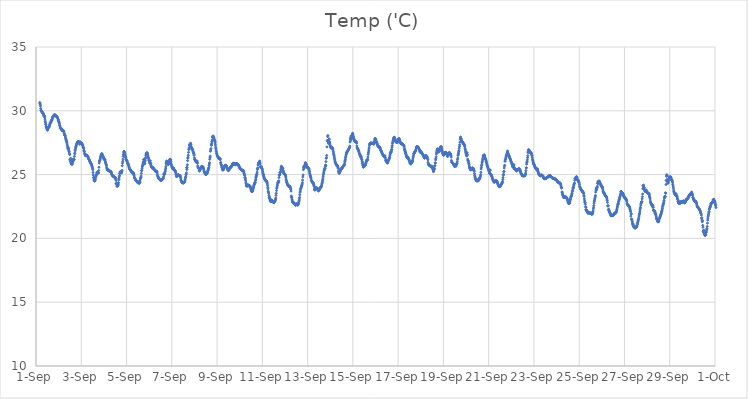
| Category | Temp ('C) |
|---|---|
| 44440.166666666664 | 30.646 |
| 44440.177083333336 | 30.575 |
| 44440.1875 | 30.514 |
| 44440.197916666664 | 30.376 |
| 44440.208333333336 | 30.177 |
| 44440.21875 | 30.047 |
| 44440.229166666664 | 30.001 |
| 44440.239583333336 | 29.987 |
| 44440.25 | 29.944 |
| 44440.260416666664 | 29.91 |
| 44440.270833333336 | 29.903 |
| 44440.28125 | 29.875 |
| 44440.291666666664 | 29.847 |
| 44440.302083333336 | 29.83 |
| 44440.3125 | 29.806 |
| 44440.322916666664 | 29.768 |
| 44440.333333333336 | 29.724 |
| 44440.34375 | 29.614 |
| 44440.354166666664 | 29.581 |
| 44440.364583333336 | 29.625 |
| 44440.375 | 29.577 |
| 44440.385416666664 | 29.495 |
| 44440.395833333336 | 29.354 |
| 44440.40625 | 29.188 |
| 44440.416666666664 | 29.091 |
| 44440.427083333336 | 28.956 |
| 44440.4375 | 28.904 |
| 44440.447916666664 | 28.769 |
| 44440.458333333336 | 28.702 |
| 44440.46875 | 28.644 |
| 44440.479166666664 | 28.683 |
| 44440.489583333336 | 28.524 |
| 44440.5 | 28.495 |
| 44440.510416666664 | 28.494 |
| 44440.520833333336 | 28.568 |
| 44440.53125 | 28.697 |
| 44440.541666666664 | 28.647 |
| 44440.552083333336 | 28.697 |
| 44440.5625 | 28.718 |
| 44440.572916666664 | 28.768 |
| 44440.583333333336 | 28.74 |
| 44440.59375 | 28.829 |
| 44440.604166666664 | 28.922 |
| 44440.614583333336 | 28.968 |
| 44440.625 | 29.049 |
| 44440.635416666664 | 29.07 |
| 44440.645833333336 | 29.068 |
| 44440.65625 | 29.108 |
| 44440.666666666664 | 29.154 |
| 44440.677083333336 | 29.228 |
| 44440.6875 | 29.249 |
| 44440.697916666664 | 29.258 |
| 44440.708333333336 | 29.309 |
| 44440.71875 | 29.369 |
| 44440.729166666664 | 29.441 |
| 44440.739583333336 | 29.498 |
| 44440.75 | 29.543 |
| 44440.760416666664 | 29.553 |
| 44440.770833333336 | 29.556 |
| 44440.78125 | 29.607 |
| 44440.791666666664 | 29.647 |
| 44440.802083333336 | 29.67 |
| 44440.8125 | 29.69 |
| 44440.822916666664 | 29.695 |
| 44440.833333333336 | 29.688 |
| 44440.84375 | 29.651 |
| 44440.854166666664 | 29.646 |
| 44440.864583333336 | 29.614 |
| 44440.875 | 29.609 |
| 44440.885416666664 | 29.603 |
| 44440.895833333336 | 29.588 |
| 44440.90625 | 29.556 |
| 44440.916666666664 | 29.551 |
| 44440.927083333336 | 29.521 |
| 44440.9375 | 29.498 |
| 44440.947916666664 | 29.475 |
| 44440.958333333336 | 29.44 |
| 44440.96875 | 29.359 |
| 44440.979166666664 | 29.27 |
| 44440.989583333336 | 29.284 |
| 44441.0 | 29.163 |
| 44441.010416666664 | 29.133 |
| 44441.020833333336 | 29.065 |
| 44441.03125 | 29.02 |
| 44441.041666666664 | 28.881 |
| 44441.052083333336 | 28.841 |
| 44441.0625 | 28.731 |
| 44441.072916666664 | 28.642 |
| 44441.083333333336 | 28.627 |
| 44441.09375 | 28.61 |
| 44441.104166666664 | 28.615 |
| 44441.114583333336 | 28.626 |
| 44441.125 | 28.555 |
| 44441.135416666664 | 28.506 |
| 44441.145833333336 | 28.491 |
| 44441.15625 | 28.468 |
| 44441.166666666664 | 28.454 |
| 44441.177083333336 | 28.452 |
| 44441.1875 | 28.456 |
| 44441.197916666664 | 28.441 |
| 44441.208333333336 | 28.447 |
| 44441.21875 | 28.422 |
| 44441.229166666664 | 28.368 |
| 44441.239583333336 | 28.267 |
| 44441.25 | 28.201 |
| 44441.260416666664 | 28.107 |
| 44441.270833333336 | 28.096 |
| 44441.28125 | 28.092 |
| 44441.291666666664 | 28.029 |
| 44441.302083333336 | 27.924 |
| 44441.3125 | 27.817 |
| 44441.322916666664 | 27.737 |
| 44441.333333333336 | 27.701 |
| 44441.34375 | 27.629 |
| 44441.354166666664 | 27.575 |
| 44441.364583333336 | 27.494 |
| 44441.375 | 27.395 |
| 44441.385416666664 | 27.284 |
| 44441.395833333336 | 27.167 |
| 44441.40625 | 27.08 |
| 44441.416666666664 | 27.021 |
| 44441.427083333336 | 26.992 |
| 44441.4375 | 27.098 |
| 44441.447916666664 | 26.918 |
| 44441.458333333336 | 26.818 |
| 44441.46875 | 26.768 |
| 44441.479166666664 | 26.622 |
| 44441.489583333336 | 26.572 |
| 44441.5 | 26.17 |
| 44441.510416666664 | 26.148 |
| 44441.520833333336 | 26.018 |
| 44441.53125 | 26.281 |
| 44441.541666666664 | 26.144 |
| 44441.552083333336 | 25.876 |
| 44441.5625 | 25.839 |
| 44441.572916666664 | 25.825 |
| 44441.583333333336 | 25.838 |
| 44441.59375 | 25.859 |
| 44441.604166666664 | 25.802 |
| 44441.614583333336 | 25.955 |
| 44441.625 | 26.014 |
| 44441.635416666664 | 26.052 |
| 44441.645833333336 | 26.215 |
| 44441.65625 | 26.161 |
| 44441.666666666664 | 26.156 |
| 44441.677083333336 | 26.182 |
| 44441.6875 | 26.187 |
| 44441.697916666664 | 26.426 |
| 44441.708333333336 | 26.635 |
| 44441.71875 | 26.69 |
| 44441.729166666664 | 26.866 |
| 44441.739583333336 | 26.97 |
| 44441.75 | 27.085 |
| 44441.760416666664 | 27.173 |
| 44441.770833333336 | 27.219 |
| 44441.78125 | 27.304 |
| 44441.791666666664 | 27.374 |
| 44441.802083333336 | 27.432 |
| 44441.8125 | 27.462 |
| 44441.822916666664 | 27.502 |
| 44441.833333333336 | 27.53 |
| 44441.84375 | 27.553 |
| 44441.854166666664 | 27.568 |
| 44441.864583333336 | 27.571 |
| 44441.875 | 27.567 |
| 44441.885416666664 | 27.567 |
| 44441.895833333336 | 27.555 |
| 44441.90625 | 27.543 |
| 44441.916666666664 | 27.545 |
| 44441.927083333336 | 27.382 |
| 44441.9375 | 27.528 |
| 44441.947916666664 | 27.57 |
| 44441.958333333336 | 27.513 |
| 44441.96875 | 27.507 |
| 44441.979166666664 | 27.47 |
| 44441.989583333336 | 27.466 |
| 44442.0 | 27.478 |
| 44442.010416666664 | 27.431 |
| 44442.020833333336 | 27.458 |
| 44442.03125 | 27.418 |
| 44442.041666666664 | 27.368 |
| 44442.052083333336 | 27.334 |
| 44442.0625 | 27.334 |
| 44442.072916666664 | 27.24 |
| 44442.083333333336 | 27.161 |
| 44442.09375 | 27.123 |
| 44442.104166666664 | 27.052 |
| 44442.114583333336 | 26.911 |
| 44442.125 | 26.848 |
| 44442.135416666664 | 26.81 |
| 44442.145833333336 | 26.67 |
| 44442.15625 | 26.611 |
| 44442.166666666664 | 26.577 |
| 44442.177083333336 | 26.518 |
| 44442.1875 | 26.492 |
| 44442.197916666664 | 26.478 |
| 44442.208333333336 | 26.507 |
| 44442.21875 | 26.537 |
| 44442.229166666664 | 26.536 |
| 44442.239583333336 | 26.493 |
| 44442.25 | 26.517 |
| 44442.260416666664 | 26.493 |
| 44442.270833333336 | 26.455 |
| 44442.28125 | 26.431 |
| 44442.291666666664 | 26.403 |
| 44442.302083333336 | 26.366 |
| 44442.3125 | 26.307 |
| 44442.322916666664 | 26.253 |
| 44442.333333333336 | 26.209 |
| 44442.34375 | 26.199 |
| 44442.354166666664 | 26.161 |
| 44442.364583333336 | 26.09 |
| 44442.375 | 26.043 |
| 44442.385416666664 | 26.007 |
| 44442.395833333336 | 25.969 |
| 44442.40625 | 25.937 |
| 44442.416666666664 | 25.913 |
| 44442.427083333336 | 25.867 |
| 44442.4375 | 25.803 |
| 44442.447916666664 | 25.837 |
| 44442.458333333336 | 25.744 |
| 44442.46875 | 25.688 |
| 44442.479166666664 | 25.627 |
| 44442.489583333336 | 25.554 |
| 44442.5 | 25.487 |
| 44442.510416666664 | 25.381 |
| 44442.520833333336 | 25.167 |
| 44442.53125 | 24.966 |
| 44442.541666666664 | 24.773 |
| 44442.552083333336 | 24.748 |
| 44442.5625 | 24.562 |
| 44442.572916666664 | 24.614 |
| 44442.583333333336 | 24.5 |
| 44442.59375 | 24.499 |
| 44442.604166666664 | 24.535 |
| 44442.614583333336 | 24.576 |
| 44442.625 | 24.662 |
| 44442.635416666664 | 24.83 |
| 44442.645833333336 | 24.821 |
| 44442.65625 | 24.931 |
| 44442.666666666664 | 25.015 |
| 44442.677083333336 | 24.991 |
| 44442.6875 | 25.131 |
| 44442.697916666664 | 25.195 |
| 44442.708333333336 | 25.121 |
| 44442.71875 | 25.174 |
| 44442.729166666664 | 25.098 |
| 44442.739583333336 | 25.146 |
| 44442.75 | 25.139 |
| 44442.760416666664 | 25.139 |
| 44442.770833333336 | 25.32 |
| 44442.78125 | 25.573 |
| 44442.791666666664 | 25.908 |
| 44442.802083333336 | 26.036 |
| 44442.8125 | 26.056 |
| 44442.822916666664 | 26.12 |
| 44442.833333333336 | 26.2 |
| 44442.84375 | 26.291 |
| 44442.854166666664 | 26.383 |
| 44442.864583333336 | 26.457 |
| 44442.875 | 26.475 |
| 44442.885416666664 | 26.565 |
| 44442.895833333336 | 26.629 |
| 44442.90625 | 26.642 |
| 44442.916666666664 | 26.609 |
| 44442.927083333336 | 26.56 |
| 44442.9375 | 26.512 |
| 44442.947916666664 | 26.468 |
| 44442.958333333336 | 26.427 |
| 44442.96875 | 26.39 |
| 44442.979166666664 | 26.344 |
| 44442.989583333336 | 26.29 |
| 44443.0 | 26.244 |
| 44443.010416666664 | 26.202 |
| 44443.020833333336 | 26.172 |
| 44443.03125 | 26.216 |
| 44443.041666666664 | 26.176 |
| 44443.052083333336 | 26.134 |
| 44443.0625 | 25.996 |
| 44443.072916666664 | 25.958 |
| 44443.083333333336 | 25.888 |
| 44443.09375 | 25.811 |
| 44443.104166666664 | 25.754 |
| 44443.114583333336 | 25.695 |
| 44443.125 | 25.534 |
| 44443.135416666664 | 25.488 |
| 44443.145833333336 | 25.388 |
| 44443.15625 | 25.438 |
| 44443.166666666664 | 25.327 |
| 44443.177083333336 | 25.36 |
| 44443.1875 | 25.351 |
| 44443.197916666664 | 25.371 |
| 44443.208333333336 | 25.348 |
| 44443.21875 | 25.318 |
| 44443.229166666664 | 25.323 |
| 44443.239583333336 | 25.262 |
| 44443.25 | 25.282 |
| 44443.260416666664 | 25.275 |
| 44443.270833333336 | 25.257 |
| 44443.28125 | 25.252 |
| 44443.291666666664 | 25.254 |
| 44443.302083333336 | 25.233 |
| 44443.3125 | 25.211 |
| 44443.322916666664 | 25.2 |
| 44443.333333333336 | 25.129 |
| 44443.34375 | 25.034 |
| 44443.354166666664 | 24.988 |
| 44443.364583333336 | 24.96 |
| 44443.375 | 24.933 |
| 44443.385416666664 | 24.913 |
| 44443.395833333336 | 24.89 |
| 44443.40625 | 24.872 |
| 44443.416666666664 | 24.857 |
| 44443.427083333336 | 24.848 |
| 44443.4375 | 24.844 |
| 44443.447916666664 | 24.83 |
| 44443.458333333336 | 24.838 |
| 44443.46875 | 24.792 |
| 44443.479166666664 | 24.778 |
| 44443.489583333336 | 24.743 |
| 44443.5 | 24.773 |
| 44443.510416666664 | 24.764 |
| 44443.520833333336 | 24.618 |
| 44443.53125 | 24.306 |
| 44443.541666666664 | 24.538 |
| 44443.552083333336 | 24.25 |
| 44443.5625 | 24.277 |
| 44443.572916666664 | 24.086 |
| 44443.583333333336 | 24.253 |
| 44443.59375 | 24.163 |
| 44443.604166666664 | 24.09 |
| 44443.614583333336 | 24.311 |
| 44443.625 | 24.241 |
| 44443.635416666664 | 24.177 |
| 44443.645833333336 | 24.371 |
| 44443.65625 | 24.68 |
| 44443.666666666664 | 24.607 |
| 44443.677083333336 | 24.818 |
| 44443.6875 | 24.913 |
| 44443.697916666664 | 25.084 |
| 44443.708333333336 | 25.133 |
| 44443.71875 | 25.218 |
| 44443.729166666664 | 25.178 |
| 44443.739583333336 | 25.181 |
| 44443.75 | 25.205 |
| 44443.760416666664 | 25.164 |
| 44443.770833333336 | 25.187 |
| 44443.78125 | 25.134 |
| 44443.791666666664 | 25.225 |
| 44443.802083333336 | 25.333 |
| 44443.8125 | 25.699 |
| 44443.822916666664 | 25.904 |
| 44443.833333333336 | 26.05 |
| 44443.84375 | 26.213 |
| 44443.854166666664 | 26.429 |
| 44443.864583333336 | 26.575 |
| 44443.875 | 26.714 |
| 44443.885416666664 | 26.803 |
| 44443.895833333336 | 26.808 |
| 44443.90625 | 26.757 |
| 44443.916666666664 | 26.704 |
| 44443.927083333336 | 26.634 |
| 44443.9375 | 26.542 |
| 44443.947916666664 | 26.448 |
| 44443.958333333336 | 26.368 |
| 44443.96875 | 26.323 |
| 44443.979166666664 | 26.214 |
| 44443.989583333336 | 26.156 |
| 44444.0 | 26.111 |
| 44444.010416666664 | 26.074 |
| 44444.020833333336 | 26.097 |
| 44444.03125 | 26.008 |
| 44444.041666666664 | 25.906 |
| 44444.052083333336 | 25.862 |
| 44444.0625 | 25.861 |
| 44444.072916666664 | 25.826 |
| 44444.083333333336 | 25.733 |
| 44444.09375 | 25.728 |
| 44444.104166666664 | 25.65 |
| 44444.114583333336 | 25.561 |
| 44444.125 | 25.504 |
| 44444.135416666664 | 25.455 |
| 44444.145833333336 | 25.407 |
| 44444.15625 | 25.423 |
| 44444.166666666664 | 25.381 |
| 44444.177083333336 | 25.368 |
| 44444.1875 | 25.301 |
| 44444.197916666664 | 25.291 |
| 44444.208333333336 | 25.263 |
| 44444.21875 | 25.241 |
| 44444.229166666664 | 25.219 |
| 44444.239583333336 | 25.187 |
| 44444.25 | 25.157 |
| 44444.260416666664 | 25.13 |
| 44444.270833333336 | 25.124 |
| 44444.28125 | 25.159 |
| 44444.291666666664 | 25.142 |
| 44444.302083333336 | 25.142 |
| 44444.3125 | 25.066 |
| 44444.322916666664 | 25.021 |
| 44444.333333333336 | 24.941 |
| 44444.34375 | 24.799 |
| 44444.354166666664 | 24.756 |
| 44444.364583333336 | 24.727 |
| 44444.375 | 24.687 |
| 44444.385416666664 | 24.647 |
| 44444.395833333336 | 24.605 |
| 44444.40625 | 24.572 |
| 44444.416666666664 | 24.554 |
| 44444.427083333336 | 24.537 |
| 44444.4375 | 24.516 |
| 44444.447916666664 | 24.487 |
| 44444.458333333336 | 24.463 |
| 44444.46875 | 24.44 |
| 44444.479166666664 | 24.407 |
| 44444.489583333336 | 24.39 |
| 44444.5 | 24.361 |
| 44444.510416666664 | 24.361 |
| 44444.520833333336 | 24.409 |
| 44444.53125 | 24.395 |
| 44444.541666666664 | 24.414 |
| 44444.552083333336 | 24.351 |
| 44444.5625 | 24.303 |
| 44444.572916666664 | 24.458 |
| 44444.583333333336 | 24.444 |
| 44444.59375 | 24.365 |
| 44444.604166666664 | 24.583 |
| 44444.614583333336 | 24.702 |
| 44444.625 | 24.764 |
| 44444.635416666664 | 24.803 |
| 44444.645833333336 | 24.886 |
| 44444.65625 | 25.097 |
| 44444.666666666664 | 25.303 |
| 44444.677083333336 | 25.345 |
| 44444.6875 | 25.49 |
| 44444.697916666664 | 25.613 |
| 44444.708333333336 | 25.686 |
| 44444.71875 | 25.769 |
| 44444.729166666664 | 25.851 |
| 44444.739583333336 | 25.958 |
| 44444.75 | 26.022 |
| 44444.760416666664 | 26.167 |
| 44444.770833333336 | 26.193 |
| 44444.78125 | 25.916 |
| 44444.791666666664 | 25.843 |
| 44444.802083333336 | 25.858 |
| 44444.8125 | 26.002 |
| 44444.822916666664 | 26.099 |
| 44444.833333333336 | 26.242 |
| 44444.84375 | 26.344 |
| 44444.854166666664 | 26.504 |
| 44444.864583333336 | 26.601 |
| 44444.875 | 26.646 |
| 44444.885416666664 | 26.694 |
| 44444.895833333336 | 26.701 |
| 44444.90625 | 26.708 |
| 44444.916666666664 | 26.686 |
| 44444.927083333336 | 26.623 |
| 44444.9375 | 26.53 |
| 44444.947916666664 | 26.444 |
| 44444.958333333336 | 26.363 |
| 44444.96875 | 26.302 |
| 44444.979166666664 | 26.221 |
| 44444.989583333336 | 26.131 |
| 44445.0 | 26.08 |
| 44445.010416666664 | 25.999 |
| 44445.020833333336 | 25.938 |
| 44445.03125 | 25.875 |
| 44445.041666666664 | 25.954 |
| 44445.052083333336 | 26.083 |
| 44445.0625 | 25.899 |
| 44445.072916666664 | 25.849 |
| 44445.083333333336 | 25.727 |
| 44445.09375 | 25.625 |
| 44445.104166666664 | 25.633 |
| 44445.114583333336 | 25.599 |
| 44445.125 | 25.591 |
| 44445.135416666664 | 25.547 |
| 44445.145833333336 | 25.493 |
| 44445.15625 | 25.566 |
| 44445.166666666664 | 25.519 |
| 44445.177083333336 | 25.529 |
| 44445.1875 | 25.471 |
| 44445.197916666664 | 25.481 |
| 44445.208333333336 | 25.439 |
| 44445.21875 | 25.425 |
| 44445.229166666664 | 25.385 |
| 44445.239583333336 | 25.377 |
| 44445.25 | 25.344 |
| 44445.260416666664 | 25.302 |
| 44445.270833333336 | 25.287 |
| 44445.28125 | 25.262 |
| 44445.291666666664 | 25.232 |
| 44445.302083333336 | 25.243 |
| 44445.3125 | 25.254 |
| 44445.322916666664 | 25.254 |
| 44445.333333333336 | 25.269 |
| 44445.34375 | 25.22 |
| 44445.354166666664 | 25.124 |
| 44445.364583333336 | 24.966 |
| 44445.375 | 24.899 |
| 44445.385416666664 | 24.858 |
| 44445.395833333336 | 24.802 |
| 44445.40625 | 24.783 |
| 44445.416666666664 | 24.714 |
| 44445.427083333336 | 24.688 |
| 44445.4375 | 24.67 |
| 44445.447916666664 | 24.653 |
| 44445.458333333336 | 24.653 |
| 44445.46875 | 24.645 |
| 44445.479166666664 | 24.62 |
| 44445.489583333336 | 24.582 |
| 44445.5 | 24.558 |
| 44445.510416666664 | 24.537 |
| 44445.520833333336 | 24.529 |
| 44445.53125 | 24.53 |
| 44445.541666666664 | 24.559 |
| 44445.552083333336 | 24.605 |
| 44445.5625 | 24.627 |
| 44445.572916666664 | 24.623 |
| 44445.583333333336 | 24.644 |
| 44445.59375 | 24.645 |
| 44445.604166666664 | 24.653 |
| 44445.614583333336 | 24.678 |
| 44445.625 | 24.739 |
| 44445.635416666664 | 24.843 |
| 44445.645833333336 | 25.005 |
| 44445.65625 | 25.074 |
| 44445.666666666664 | 25.059 |
| 44445.677083333336 | 25.031 |
| 44445.6875 | 25.039 |
| 44445.697916666664 | 25.136 |
| 44445.708333333336 | 25.255 |
| 44445.71875 | 25.369 |
| 44445.729166666664 | 25.503 |
| 44445.739583333336 | 25.646 |
| 44445.75 | 25.846 |
| 44445.760416666664 | 25.934 |
| 44445.770833333336 | 26.068 |
| 44445.78125 | 26.026 |
| 44445.791666666664 | 25.993 |
| 44445.802083333336 | 26.008 |
| 44445.8125 | 25.927 |
| 44445.822916666664 | 25.845 |
| 44445.833333333336 | 25.824 |
| 44445.84375 | 25.79 |
| 44445.854166666664 | 25.847 |
| 44445.864583333336 | 25.839 |
| 44445.875 | 25.888 |
| 44445.885416666664 | 25.994 |
| 44445.895833333336 | 26.125 |
| 44445.90625 | 26.173 |
| 44445.916666666664 | 26.202 |
| 44445.927083333336 | 26.201 |
| 44445.9375 | 26.19 |
| 44445.947916666664 | 26.14 |
| 44445.958333333336 | 26.036 |
| 44445.96875 | 25.896 |
| 44445.979166666664 | 25.787 |
| 44445.989583333336 | 25.702 |
| 44446.0 | 25.623 |
| 44446.010416666664 | 25.577 |
| 44446.020833333336 | 25.535 |
| 44446.03125 | 25.503 |
| 44446.041666666664 | 25.468 |
| 44446.052083333336 | 25.448 |
| 44446.0625 | 25.44 |
| 44446.072916666664 | 25.493 |
| 44446.083333333336 | 25.515 |
| 44446.09375 | 25.429 |
| 44446.104166666664 | 25.396 |
| 44446.114583333336 | 25.374 |
| 44446.125 | 25.326 |
| 44446.135416666664 | 25.306 |
| 44446.145833333336 | 25.28 |
| 44446.15625 | 25.269 |
| 44446.166666666664 | 25.198 |
| 44446.177083333336 | 25.126 |
| 44446.1875 | 25.011 |
| 44446.197916666664 | 24.963 |
| 44446.208333333336 | 24.84 |
| 44446.21875 | 24.874 |
| 44446.229166666664 | 24.887 |
| 44446.239583333336 | 24.959 |
| 44446.25 | 24.944 |
| 44446.260416666664 | 24.968 |
| 44446.270833333336 | 24.933 |
| 44446.28125 | 24.955 |
| 44446.291666666664 | 24.994 |
| 44446.302083333336 | 24.971 |
| 44446.3125 | 24.937 |
| 44446.322916666664 | 24.938 |
| 44446.333333333336 | 24.888 |
| 44446.34375 | 24.927 |
| 44446.354166666664 | 24.93 |
| 44446.364583333336 | 24.913 |
| 44446.375 | 24.868 |
| 44446.385416666664 | 24.795 |
| 44446.395833333336 | 24.663 |
| 44446.40625 | 24.564 |
| 44446.416666666664 | 24.507 |
| 44446.427083333336 | 24.472 |
| 44446.4375 | 24.435 |
| 44446.447916666664 | 24.406 |
| 44446.458333333336 | 24.381 |
| 44446.46875 | 24.372 |
| 44446.479166666664 | 24.362 |
| 44446.489583333336 | 24.352 |
| 44446.5 | 24.35 |
| 44446.510416666664 | 24.352 |
| 44446.520833333336 | 24.357 |
| 44446.53125 | 24.371 |
| 44446.541666666664 | 24.384 |
| 44446.552083333336 | 24.421 |
| 44446.5625 | 24.43 |
| 44446.572916666664 | 24.46 |
| 44446.583333333336 | 24.56 |
| 44446.59375 | 24.651 |
| 44446.604166666664 | 24.757 |
| 44446.614583333336 | 24.834 |
| 44446.625 | 24.983 |
| 44446.635416666664 | 25.041 |
| 44446.645833333336 | 25.144 |
| 44446.65625 | 25.534 |
| 44446.666666666664 | 25.399 |
| 44446.677083333336 | 25.556 |
| 44446.6875 | 25.764 |
| 44446.697916666664 | 26.094 |
| 44446.708333333336 | 26.287 |
| 44446.71875 | 26.347 |
| 44446.729166666664 | 26.517 |
| 44446.739583333336 | 26.743 |
| 44446.75 | 26.967 |
| 44446.760416666664 | 27.011 |
| 44446.770833333336 | 27.112 |
| 44446.78125 | 27.275 |
| 44446.791666666664 | 27.349 |
| 44446.802083333336 | 27.332 |
| 44446.8125 | 27.422 |
| 44446.822916666664 | 27.328 |
| 44446.833333333336 | 27.455 |
| 44446.84375 | 27.354 |
| 44446.854166666664 | 27.209 |
| 44446.864583333336 | 27.127 |
| 44446.875 | 27.102 |
| 44446.885416666664 | 27.029 |
| 44446.895833333336 | 26.994 |
| 44446.90625 | 26.997 |
| 44446.916666666664 | 26.971 |
| 44446.927083333336 | 26.892 |
| 44446.9375 | 26.806 |
| 44446.947916666664 | 26.758 |
| 44446.958333333336 | 26.7 |
| 44446.96875 | 26.655 |
| 44446.979166666664 | 26.573 |
| 44446.989583333336 | 26.509 |
| 44447.0 | 26.31 |
| 44447.010416666664 | 26.181 |
| 44447.020833333336 | 26.199 |
| 44447.03125 | 26.14 |
| 44447.041666666664 | 26.095 |
| 44447.052083333336 | 26.061 |
| 44447.0625 | 26.032 |
| 44447.072916666664 | 26.021 |
| 44447.083333333336 | 25.979 |
| 44447.09375 | 25.948 |
| 44447.104166666664 | 26.022 |
| 44447.114583333336 | 26.074 |
| 44447.125 | 25.96 |
| 44447.135416666664 | 25.884 |
| 44447.145833333336 | 25.679 |
| 44447.15625 | 25.593 |
| 44447.166666666664 | 25.532 |
| 44447.177083333336 | 25.493 |
| 44447.1875 | 25.49 |
| 44447.197916666664 | 25.514 |
| 44447.208333333336 | 25.293 |
| 44447.21875 | 25.462 |
| 44447.229166666664 | 25.286 |
| 44447.239583333336 | 25.388 |
| 44447.25 | 25.375 |
| 44447.260416666664 | 25.488 |
| 44447.270833333336 | 25.465 |
| 44447.28125 | 25.432 |
| 44447.291666666664 | 25.561 |
| 44447.302083333336 | 25.59 |
| 44447.3125 | 25.645 |
| 44447.322916666664 | 25.634 |
| 44447.333333333336 | 25.6 |
| 44447.34375 | 25.615 |
| 44447.354166666664 | 25.588 |
| 44447.364583333336 | 25.567 |
| 44447.375 | 25.597 |
| 44447.385416666664 | 25.589 |
| 44447.395833333336 | 25.506 |
| 44447.40625 | 25.445 |
| 44447.416666666664 | 25.362 |
| 44447.427083333336 | 25.265 |
| 44447.4375 | 25.213 |
| 44447.447916666664 | 25.165 |
| 44447.458333333336 | 25.138 |
| 44447.46875 | 25.091 |
| 44447.479166666664 | 25.062 |
| 44447.489583333336 | 25.016 |
| 44447.5 | 25.006 |
| 44447.510416666664 | 25.02 |
| 44447.520833333336 | 25.041 |
| 44447.53125 | 25.067 |
| 44447.541666666664 | 25.088 |
| 44447.552083333336 | 25.115 |
| 44447.5625 | 25.137 |
| 44447.572916666664 | 25.162 |
| 44447.583333333336 | 25.202 |
| 44447.59375 | 25.306 |
| 44447.604166666664 | 25.34 |
| 44447.614583333336 | 25.405 |
| 44447.625 | 25.494 |
| 44447.635416666664 | 25.556 |
| 44447.645833333336 | 25.704 |
| 44447.65625 | 25.823 |
| 44447.666666666664 | 25.928 |
| 44447.677083333336 | 26.199 |
| 44447.6875 | 26.332 |
| 44447.697916666664 | 26.448 |
| 44447.708333333336 | 26.831 |
| 44447.71875 | 26.937 |
| 44447.729166666664 | 27.044 |
| 44447.739583333336 | 27.336 |
| 44447.75 | 27.301 |
| 44447.760416666664 | 27.439 |
| 44447.770833333336 | 27.579 |
| 44447.78125 | 27.709 |
| 44447.791666666664 | 27.929 |
| 44447.802083333336 | 27.988 |
| 44447.8125 | 27.954 |
| 44447.822916666664 | 28.021 |
| 44447.833333333336 | 28.009 |
| 44447.84375 | 27.898 |
| 44447.854166666664 | 27.896 |
| 44447.864583333336 | 27.847 |
| 44447.875 | 27.715 |
| 44447.885416666664 | 27.732 |
| 44447.895833333336 | 27.673 |
| 44447.90625 | 27.593 |
| 44447.916666666664 | 27.486 |
| 44447.927083333336 | 27.325 |
| 44447.9375 | 27.149 |
| 44447.947916666664 | 27.048 |
| 44447.958333333336 | 26.911 |
| 44447.96875 | 26.803 |
| 44447.979166666664 | 26.68 |
| 44447.989583333336 | 26.621 |
| 44448.0 | 26.541 |
| 44448.010416666664 | 26.467 |
| 44448.020833333336 | 26.439 |
| 44448.03125 | 26.417 |
| 44448.041666666664 | 26.396 |
| 44448.052083333336 | 26.355 |
| 44448.0625 | 26.303 |
| 44448.072916666664 | 26.265 |
| 44448.083333333336 | 26.266 |
| 44448.09375 | 26.248 |
| 44448.104166666664 | 26.234 |
| 44448.114583333336 | 26.239 |
| 44448.125 | 26.285 |
| 44448.135416666664 | 26.241 |
| 44448.145833333336 | 26.169 |
| 44448.15625 | 25.922 |
| 44448.166666666664 | 25.951 |
| 44448.177083333336 | 25.82 |
| 44448.1875 | 25.777 |
| 44448.197916666664 | 25.7 |
| 44448.208333333336 | 25.591 |
| 44448.21875 | 25.531 |
| 44448.229166666664 | 25.576 |
| 44448.239583333336 | 25.421 |
| 44448.25 | 25.353 |
| 44448.260416666664 | 25.376 |
| 44448.270833333336 | 25.429 |
| 44448.28125 | 25.383 |
| 44448.291666666664 | 25.434 |
| 44448.302083333336 | 25.514 |
| 44448.3125 | 25.6 |
| 44448.322916666664 | 25.632 |
| 44448.333333333336 | 25.687 |
| 44448.34375 | 25.704 |
| 44448.354166666664 | 25.723 |
| 44448.364583333336 | 25.735 |
| 44448.375 | 25.717 |
| 44448.385416666664 | 25.689 |
| 44448.395833333336 | 25.675 |
| 44448.40625 | 25.7 |
| 44448.416666666664 | 25.681 |
| 44448.427083333336 | 25.592 |
| 44448.4375 | 25.514 |
| 44448.447916666664 | 25.475 |
| 44448.458333333336 | 25.424 |
| 44448.46875 | 25.39 |
| 44448.479166666664 | 25.369 |
| 44448.489583333336 | 25.34 |
| 44448.5 | 25.319 |
| 44448.510416666664 | 25.331 |
| 44448.520833333336 | 25.352 |
| 44448.53125 | 25.385 |
| 44448.541666666664 | 25.44 |
| 44448.552083333336 | 25.476 |
| 44448.5625 | 25.509 |
| 44448.572916666664 | 25.534 |
| 44448.583333333336 | 25.553 |
| 44448.59375 | 25.563 |
| 44448.604166666664 | 25.575 |
| 44448.614583333336 | 25.594 |
| 44448.625 | 25.609 |
| 44448.635416666664 | 25.65 |
| 44448.645833333336 | 25.657 |
| 44448.65625 | 25.686 |
| 44448.666666666664 | 25.752 |
| 44448.677083333336 | 25.824 |
| 44448.6875 | 25.864 |
| 44448.697916666664 | 25.858 |
| 44448.708333333336 | 25.901 |
| 44448.71875 | 25.868 |
| 44448.729166666664 | 25.791 |
| 44448.739583333336 | 25.786 |
| 44448.75 | 25.792 |
| 44448.760416666664 | 25.82 |
| 44448.770833333336 | 25.821 |
| 44448.78125 | 25.866 |
| 44448.791666666664 | 25.867 |
| 44448.802083333336 | 25.8 |
| 44448.8125 | 25.774 |
| 44448.822916666664 | 25.81 |
| 44448.833333333336 | 25.828 |
| 44448.84375 | 25.834 |
| 44448.854166666664 | 25.845 |
| 44448.864583333336 | 25.847 |
| 44448.875 | 25.843 |
| 44448.885416666664 | 25.831 |
| 44448.895833333336 | 25.829 |
| 44448.90625 | 25.807 |
| 44448.916666666664 | 25.788 |
| 44448.927083333336 | 25.777 |
| 44448.9375 | 25.759 |
| 44448.947916666664 | 25.733 |
| 44448.958333333336 | 25.688 |
| 44448.96875 | 25.654 |
| 44448.979166666664 | 25.606 |
| 44448.989583333336 | 25.575 |
| 44449.0 | 25.54 |
| 44449.010416666664 | 25.506 |
| 44449.020833333336 | 25.473 |
| 44449.03125 | 25.454 |
| 44449.041666666664 | 25.434 |
| 44449.052083333336 | 25.417 |
| 44449.0625 | 25.406 |
| 44449.072916666664 | 25.398 |
| 44449.083333333336 | 25.384 |
| 44449.09375 | 25.367 |
| 44449.104166666664 | 25.351 |
| 44449.114583333336 | 25.335 |
| 44449.125 | 25.322 |
| 44449.135416666664 | 25.311 |
| 44449.145833333336 | 25.293 |
| 44449.15625 | 25.277 |
| 44449.166666666664 | 25.316 |
| 44449.177083333336 | 25.224 |
| 44449.1875 | 25.14 |
| 44449.197916666664 | 25.083 |
| 44449.208333333336 | 24.995 |
| 44449.21875 | 24.933 |
| 44449.229166666664 | 24.779 |
| 44449.239583333336 | 24.747 |
| 44449.25 | 24.664 |
| 44449.260416666664 | 24.561 |
| 44449.270833333336 | 24.414 |
| 44449.28125 | 24.294 |
| 44449.291666666664 | 24.164 |
| 44449.302083333336 | 24.098 |
| 44449.3125 | 24.229 |
| 44449.322916666664 | 24.108 |
| 44449.333333333336 | 24.098 |
| 44449.34375 | 24.152 |
| 44449.354166666664 | 24.125 |
| 44449.364583333336 | 24.18 |
| 44449.375 | 24.164 |
| 44449.385416666664 | 24.156 |
| 44449.395833333336 | 24.17 |
| 44449.40625 | 24.119 |
| 44449.416666666664 | 24.1 |
| 44449.427083333336 | 24.102 |
| 44449.4375 | 24.105 |
| 44449.447916666664 | 24.115 |
| 44449.458333333336 | 24.101 |
| 44449.46875 | 24.033 |
| 44449.479166666664 | 23.972 |
| 44449.489583333336 | 23.914 |
| 44449.5 | 23.832 |
| 44449.510416666664 | 23.759 |
| 44449.520833333336 | 23.699 |
| 44449.53125 | 23.675 |
| 44449.541666666664 | 23.665 |
| 44449.552083333336 | 23.669 |
| 44449.5625 | 23.69 |
| 44449.572916666664 | 23.735 |
| 44449.583333333336 | 23.815 |
| 44449.59375 | 23.896 |
| 44449.604166666664 | 23.972 |
| 44449.614583333336 | 24.054 |
| 44449.625 | 24.125 |
| 44449.635416666664 | 24.193 |
| 44449.645833333336 | 24.24 |
| 44449.65625 | 24.3 |
| 44449.666666666664 | 24.328 |
| 44449.677083333336 | 24.395 |
| 44449.6875 | 24.393 |
| 44449.697916666664 | 24.539 |
| 44449.708333333336 | 24.636 |
| 44449.71875 | 24.773 |
| 44449.729166666664 | 24.843 |
| 44449.739583333336 | 24.921 |
| 44449.75 | 25.029 |
| 44449.760416666664 | 25.032 |
| 44449.770833333336 | 25.193 |
| 44449.78125 | 25.396 |
| 44449.791666666664 | 25.482 |
| 44449.802083333336 | 25.529 |
| 44449.8125 | 25.754 |
| 44449.822916666664 | 25.786 |
| 44449.833333333336 | 25.932 |
| 44449.84375 | 25.932 |
| 44449.854166666664 | 25.86 |
| 44449.864583333336 | 25.968 |
| 44449.875 | 26.015 |
| 44449.885416666664 | 26.061 |
| 44449.895833333336 | 25.981 |
| 44449.90625 | 25.846 |
| 44449.916666666664 | 25.626 |
| 44449.927083333336 | 25.622 |
| 44449.9375 | 25.565 |
| 44449.947916666664 | 25.62 |
| 44449.958333333336 | 25.575 |
| 44449.96875 | 25.52 |
| 44449.979166666664 | 25.508 |
| 44449.989583333336 | 25.474 |
| 44450.0 | 25.391 |
| 44450.010416666664 | 25.275 |
| 44450.020833333336 | 25.162 |
| 44450.03125 | 25.074 |
| 44450.041666666664 | 25.003 |
| 44450.052083333336 | 24.946 |
| 44450.0625 | 24.858 |
| 44450.072916666664 | 24.782 |
| 44450.083333333336 | 24.731 |
| 44450.09375 | 24.689 |
| 44450.104166666664 | 24.641 |
| 44450.114583333336 | 24.591 |
| 44450.125 | 24.573 |
| 44450.135416666664 | 24.558 |
| 44450.145833333336 | 24.545 |
| 44450.15625 | 24.527 |
| 44450.166666666664 | 24.509 |
| 44450.177083333336 | 24.486 |
| 44450.1875 | 24.438 |
| 44450.197916666664 | 24.488 |
| 44450.208333333336 | 24.394 |
| 44450.21875 | 24.288 |
| 44450.229166666664 | 24.167 |
| 44450.239583333336 | 24.007 |
| 44450.25 | 23.888 |
| 44450.260416666664 | 23.7 |
| 44450.270833333336 | 23.619 |
| 44450.28125 | 23.55 |
| 44450.291666666664 | 23.378 |
| 44450.302083333336 | 23.186 |
| 44450.3125 | 23.259 |
| 44450.322916666664 | 23.124 |
| 44450.333333333336 | 23.087 |
| 44450.34375 | 22.929 |
| 44450.354166666664 | 22.965 |
| 44450.364583333336 | 22.902 |
| 44450.375 | 22.944 |
| 44450.385416666664 | 22.936 |
| 44450.395833333336 | 22.988 |
| 44450.40625 | 23.004 |
| 44450.416666666664 | 22.961 |
| 44450.427083333336 | 22.915 |
| 44450.4375 | 22.953 |
| 44450.447916666664 | 22.903 |
| 44450.458333333336 | 22.844 |
| 44450.46875 | 22.883 |
| 44450.479166666664 | 22.887 |
| 44450.489583333336 | 22.893 |
| 44450.5 | 22.86 |
| 44450.510416666664 | 22.817 |
| 44450.520833333336 | 22.836 |
| 44450.53125 | 22.85 |
| 44450.541666666664 | 22.884 |
| 44450.552083333336 | 22.904 |
| 44450.5625 | 22.95 |
| 44450.572916666664 | 23.008 |
| 44450.583333333336 | 23.062 |
| 44450.59375 | 23.163 |
| 44450.604166666664 | 23.373 |
| 44450.614583333336 | 23.529 |
| 44450.625 | 23.751 |
| 44450.635416666664 | 23.922 |
| 44450.645833333336 | 24.006 |
| 44450.65625 | 24.112 |
| 44450.666666666664 | 24.195 |
| 44450.677083333336 | 24.342 |
| 44450.6875 | 24.34 |
| 44450.697916666664 | 24.394 |
| 44450.708333333336 | 24.468 |
| 44450.71875 | 24.387 |
| 44450.729166666664 | 24.512 |
| 44450.739583333336 | 24.77 |
| 44450.75 | 24.931 |
| 44450.760416666664 | 25.008 |
| 44450.770833333336 | 25.018 |
| 44450.78125 | 25.186 |
| 44450.791666666664 | 25.142 |
| 44450.802083333336 | 25.22 |
| 44450.8125 | 25.384 |
| 44450.822916666664 | 25.511 |
| 44450.833333333336 | 25.601 |
| 44450.84375 | 25.66 |
| 44450.854166666664 | 25.456 |
| 44450.864583333336 | 25.474 |
| 44450.875 | 25.524 |
| 44450.885416666664 | 25.56 |
| 44450.895833333336 | 25.524 |
| 44450.90625 | 25.471 |
| 44450.916666666664 | 25.322 |
| 44450.927083333336 | 25.255 |
| 44450.9375 | 25.139 |
| 44450.947916666664 | 25.115 |
| 44450.958333333336 | 25.072 |
| 44450.96875 | 25.06 |
| 44450.979166666664 | 25.043 |
| 44450.989583333336 | 25.05 |
| 44451.0 | 25.02 |
| 44451.010416666664 | 25.002 |
| 44451.020833333336 | 24.939 |
| 44451.03125 | 24.872 |
| 44451.041666666664 | 24.748 |
| 44451.052083333336 | 24.618 |
| 44451.0625 | 24.523 |
| 44451.072916666664 | 24.414 |
| 44451.083333333336 | 24.383 |
| 44451.09375 | 24.323 |
| 44451.104166666664 | 24.259 |
| 44451.114583333336 | 24.223 |
| 44451.125 | 24.182 |
| 44451.135416666664 | 24.144 |
| 44451.145833333336 | 24.116 |
| 44451.15625 | 24.104 |
| 44451.166666666664 | 24.098 |
| 44451.177083333336 | 24.096 |
| 44451.1875 | 24.087 |
| 44451.197916666664 | 24.083 |
| 44451.208333333336 | 24.09 |
| 44451.21875 | 24.027 |
| 44451.229166666664 | 24.054 |
| 44451.239583333336 | 23.964 |
| 44451.25 | 23.87 |
| 44451.260416666664 | 23.858 |
| 44451.270833333336 | 23.709 |
| 44451.28125 | 23.319 |
| 44451.291666666664 | 23.198 |
| 44451.302083333336 | 23.215 |
| 44451.3125 | 23.062 |
| 44451.322916666664 | 22.952 |
| 44451.333333333336 | 22.85 |
| 44451.34375 | 22.828 |
| 44451.354166666664 | 22.816 |
| 44451.364583333336 | 22.799 |
| 44451.375 | 22.759 |
| 44451.385416666664 | 22.741 |
| 44451.395833333336 | 22.784 |
| 44451.40625 | 22.759 |
| 44451.416666666664 | 22.755 |
| 44451.427083333336 | 22.71 |
| 44451.4375 | 22.681 |
| 44451.447916666664 | 22.638 |
| 44451.458333333336 | 22.632 |
| 44451.46875 | 22.601 |
| 44451.479166666664 | 22.62 |
| 44451.489583333336 | 22.632 |
| 44451.5 | 22.662 |
| 44451.510416666664 | 22.706 |
| 44451.520833333336 | 22.722 |
| 44451.53125 | 22.671 |
| 44451.541666666664 | 22.651 |
| 44451.552083333336 | 22.631 |
| 44451.5625 | 22.603 |
| 44451.572916666664 | 22.63 |
| 44451.583333333336 | 22.668 |
| 44451.59375 | 22.725 |
| 44451.604166666664 | 22.795 |
| 44451.614583333336 | 22.876 |
| 44451.625 | 22.972 |
| 44451.635416666664 | 23.085 |
| 44451.645833333336 | 23.215 |
| 44451.65625 | 23.424 |
| 44451.666666666664 | 23.611 |
| 44451.677083333336 | 23.698 |
| 44451.6875 | 23.838 |
| 44451.697916666664 | 23.905 |
| 44451.708333333336 | 23.965 |
| 44451.71875 | 24.032 |
| 44451.729166666664 | 24.081 |
| 44451.739583333336 | 24.129 |
| 44451.75 | 24.194 |
| 44451.760416666664 | 24.269 |
| 44451.770833333336 | 24.374 |
| 44451.78125 | 24.566 |
| 44451.791666666664 | 24.816 |
| 44451.802083333336 | 24.972 |
| 44451.8125 | 25.386 |
| 44451.822916666664 | 25.595 |
| 44451.833333333336 | 25.591 |
| 44451.84375 | 25.485 |
| 44451.854166666664 | 25.684 |
| 44451.864583333336 | 25.648 |
| 44451.875 | 25.598 |
| 44451.885416666664 | 25.788 |
| 44451.895833333336 | 25.915 |
| 44451.90625 | 25.935 |
| 44451.916666666664 | 25.874 |
| 44451.927083333336 | 25.838 |
| 44451.9375 | 25.758 |
| 44451.947916666664 | 25.78 |
| 44451.958333333336 | 25.623 |
| 44451.96875 | 25.636 |
| 44451.979166666664 | 25.61 |
| 44451.989583333336 | 25.556 |
| 44452.0 | 25.546 |
| 44452.010416666664 | 25.58 |
| 44452.020833333336 | 25.517 |
| 44452.03125 | 25.495 |
| 44452.041666666664 | 25.501 |
| 44452.052083333336 | 25.474 |
| 44452.0625 | 25.429 |
| 44452.072916666664 | 25.34 |
| 44452.083333333336 | 25.221 |
| 44452.09375 | 25.109 |
| 44452.104166666664 | 25.022 |
| 44452.114583333336 | 24.935 |
| 44452.125 | 24.887 |
| 44452.135416666664 | 24.806 |
| 44452.145833333336 | 24.745 |
| 44452.15625 | 24.654 |
| 44452.166666666664 | 24.55 |
| 44452.177083333336 | 24.512 |
| 44452.1875 | 24.469 |
| 44452.197916666664 | 24.451 |
| 44452.208333333336 | 24.409 |
| 44452.21875 | 24.38 |
| 44452.229166666664 | 24.355 |
| 44452.239583333336 | 24.336 |
| 44452.25 | 24.354 |
| 44452.260416666664 | 24.295 |
| 44452.270833333336 | 24.205 |
| 44452.28125 | 24.143 |
| 44452.291666666664 | 24.055 |
| 44452.302083333336 | 23.872 |
| 44452.3125 | 23.805 |
| 44452.322916666664 | 23.791 |
| 44452.333333333336 | 23.849 |
| 44452.34375 | 23.879 |
| 44452.354166666664 | 23.84 |
| 44452.364583333336 | 23.934 |
| 44452.375 | 23.975 |
| 44452.385416666664 | 23.989 |
| 44452.395833333336 | 23.979 |
| 44452.40625 | 23.914 |
| 44452.416666666664 | 23.921 |
| 44452.427083333336 | 23.85 |
| 44452.4375 | 23.903 |
| 44452.447916666664 | 23.852 |
| 44452.458333333336 | 23.827 |
| 44452.46875 | 23.785 |
| 44452.479166666664 | 23.706 |
| 44452.489583333336 | 23.763 |
| 44452.5 | 23.779 |
| 44452.510416666664 | 23.825 |
| 44452.520833333336 | 23.827 |
| 44452.53125 | 23.871 |
| 44452.541666666664 | 23.923 |
| 44452.552083333336 | 23.965 |
| 44452.5625 | 23.989 |
| 44452.572916666664 | 23.991 |
| 44452.583333333336 | 23.995 |
| 44452.59375 | 24.032 |
| 44452.604166666664 | 24.059 |
| 44452.614583333336 | 24.112 |
| 44452.625 | 24.19 |
| 44452.635416666664 | 24.288 |
| 44452.645833333336 | 24.369 |
| 44452.65625 | 24.49 |
| 44452.666666666664 | 24.597 |
| 44452.677083333336 | 24.727 |
| 44452.6875 | 24.862 |
| 44452.697916666664 | 24.991 |
| 44452.708333333336 | 25.105 |
| 44452.71875 | 25.208 |
| 44452.729166666664 | 25.297 |
| 44452.739583333336 | 25.368 |
| 44452.75 | 25.422 |
| 44452.760416666664 | 25.47 |
| 44452.770833333336 | 25.517 |
| 44452.78125 | 25.633 |
| 44452.791666666664 | 25.75 |
| 44452.802083333336 | 25.709 |
| 44452.8125 | 26.017 |
| 44452.822916666664 | 26.276 |
| 44452.833333333336 | 26.329 |
| 44452.84375 | 26.499 |
| 44452.854166666664 | 27.17 |
| 44452.864583333336 | 27.66 |
| 44452.875 | 27.649 |
| 44452.885416666664 | 27.982 |
| 44452.895833333336 | 28.056 |
| 44452.90625 | 27.631 |
| 44452.916666666664 | 27.47 |
| 44452.927083333336 | 27.44 |
| 44452.9375 | 27.54 |
| 44452.947916666664 | 27.775 |
| 44452.958333333336 | 27.787 |
| 44452.96875 | 27.58 |
| 44452.979166666664 | 27.471 |
| 44452.989583333336 | 27.397 |
| 44453.0 | 27.274 |
| 44453.010416666664 | 27.218 |
| 44453.020833333336 | 27.137 |
| 44453.03125 | 27.117 |
| 44453.041666666664 | 27.072 |
| 44453.052083333336 | 27.08 |
| 44453.0625 | 27.072 |
| 44453.072916666664 | 27.118 |
| 44453.083333333336 | 27.071 |
| 44453.09375 | 27.086 |
| 44453.104166666664 | 27.085 |
| 44453.114583333336 | 27.045 |
| 44453.125 | 26.924 |
| 44453.135416666664 | 26.795 |
| 44453.145833333336 | 26.677 |
| 44453.15625 | 26.577 |
| 44453.166666666664 | 26.514 |
| 44453.177083333336 | 26.391 |
| 44453.1875 | 26.283 |
| 44453.197916666664 | 26.16 |
| 44453.208333333336 | 26.066 |
| 44453.21875 | 25.989 |
| 44453.229166666664 | 25.942 |
| 44453.239583333336 | 25.896 |
| 44453.25 | 25.859 |
| 44453.260416666664 | 25.815 |
| 44453.270833333336 | 25.764 |
| 44453.28125 | 25.733 |
| 44453.291666666664 | 25.705 |
| 44453.302083333336 | 25.694 |
| 44453.3125 | 25.702 |
| 44453.322916666664 | 25.709 |
| 44453.333333333336 | 25.619 |
| 44453.34375 | 25.541 |
| 44453.354166666664 | 25.477 |
| 44453.364583333336 | 25.27 |
| 44453.375 | 25.201 |
| 44453.385416666664 | 25.114 |
| 44453.395833333336 | 25.206 |
| 44453.40625 | 25.106 |
| 44453.416666666664 | 25.176 |
| 44453.427083333336 | 25.264 |
| 44453.4375 | 25.289 |
| 44453.447916666664 | 25.293 |
| 44453.458333333336 | 25.351 |
| 44453.46875 | 25.439 |
| 44453.479166666664 | 25.451 |
| 44453.489583333336 | 25.425 |
| 44453.5 | 25.492 |
| 44453.510416666664 | 25.482 |
| 44453.520833333336 | 25.488 |
| 44453.53125 | 25.525 |
| 44453.541666666664 | 25.571 |
| 44453.552083333336 | 25.616 |
| 44453.5625 | 25.643 |
| 44453.572916666664 | 25.641 |
| 44453.583333333336 | 25.642 |
| 44453.59375 | 25.667 |
| 44453.604166666664 | 25.728 |
| 44453.614583333336 | 25.758 |
| 44453.625 | 25.768 |
| 44453.635416666664 | 25.886 |
| 44453.645833333336 | 26.014 |
| 44453.65625 | 26.094 |
| 44453.666666666664 | 26.194 |
| 44453.677083333336 | 26.327 |
| 44453.6875 | 26.435 |
| 44453.697916666664 | 26.541 |
| 44453.708333333336 | 26.612 |
| 44453.71875 | 26.676 |
| 44453.729166666664 | 26.722 |
| 44453.739583333336 | 26.768 |
| 44453.75 | 26.788 |
| 44453.760416666664 | 26.829 |
| 44453.770833333336 | 26.857 |
| 44453.78125 | 26.89 |
| 44453.791666666664 | 26.931 |
| 44453.802083333336 | 26.958 |
| 44453.8125 | 26.984 |
| 44453.822916666664 | 27.027 |
| 44453.833333333336 | 27.087 |
| 44453.84375 | 27.086 |
| 44453.854166666664 | 27.136 |
| 44453.864583333336 | 27.229 |
| 44453.875 | 27.555 |
| 44453.885416666664 | 27.798 |
| 44453.895833333336 | 27.654 |
| 44453.90625 | 27.897 |
| 44453.916666666664 | 28.019 |
| 44453.927083333336 | 27.813 |
| 44453.9375 | 27.803 |
| 44453.947916666664 | 27.893 |
| 44453.958333333336 | 28.001 |
| 44453.96875 | 28.061 |
| 44453.979166666664 | 28.183 |
| 44453.989583333336 | 28.242 |
| 44454.0 | 28.169 |
| 44454.010416666664 | 28.093 |
| 44454.020833333336 | 27.986 |
| 44454.03125 | 27.914 |
| 44454.041666666664 | 27.827 |
| 44454.052083333336 | 27.748 |
| 44454.0625 | 27.707 |
| 44454.072916666664 | 27.657 |
| 44454.083333333336 | 27.619 |
| 44454.09375 | 27.616 |
| 44454.104166666664 | 27.589 |
| 44454.114583333336 | 27.62 |
| 44454.125 | 27.6 |
| 44454.135416666664 | 27.594 |
| 44454.145833333336 | 27.58 |
| 44454.15625 | 27.521 |
| 44454.166666666664 | 27.461 |
| 44454.177083333336 | 27.246 |
| 44454.1875 | 27.107 |
| 44454.197916666664 | 27.074 |
| 44454.208333333336 | 27.043 |
| 44454.21875 | 27.015 |
| 44454.229166666664 | 26.965 |
| 44454.239583333336 | 26.922 |
| 44454.25 | 26.878 |
| 44454.260416666664 | 26.825 |
| 44454.270833333336 | 26.767 |
| 44454.28125 | 26.693 |
| 44454.291666666664 | 26.633 |
| 44454.302083333336 | 26.577 |
| 44454.3125 | 26.541 |
| 44454.322916666664 | 26.473 |
| 44454.333333333336 | 26.43 |
| 44454.34375 | 26.402 |
| 44454.354166666664 | 26.472 |
| 44454.364583333336 | 26.401 |
| 44454.375 | 26.326 |
| 44454.385416666664 | 26.236 |
| 44454.395833333336 | 26.168 |
| 44454.40625 | 26.057 |
| 44454.416666666664 | 25.862 |
| 44454.427083333336 | 25.972 |
| 44454.4375 | 25.714 |
| 44454.447916666664 | 25.833 |
| 44454.458333333336 | 25.596 |
| 44454.46875 | 25.593 |
| 44454.479166666664 | 25.752 |
| 44454.489583333336 | 25.611 |
| 44454.5 | 25.668 |
| 44454.510416666664 | 25.706 |
| 44454.520833333336 | 25.687 |
| 44454.53125 | 25.717 |
| 44454.541666666664 | 25.728 |
| 44454.552083333336 | 25.769 |
| 44454.5625 | 25.824 |
| 44454.572916666664 | 25.893 |
| 44454.583333333336 | 25.956 |
| 44454.59375 | 26.017 |
| 44454.604166666664 | 26.108 |
| 44454.614583333336 | 26.137 |
| 44454.625 | 26.124 |
| 44454.635416666664 | 26.154 |
| 44454.645833333336 | 26.138 |
| 44454.65625 | 26.204 |
| 44454.666666666664 | 26.38 |
| 44454.677083333336 | 26.58 |
| 44454.6875 | 26.71 |
| 44454.697916666664 | 26.845 |
| 44454.708333333336 | 26.997 |
| 44454.71875 | 27.099 |
| 44454.729166666664 | 27.272 |
| 44454.739583333336 | 27.346 |
| 44454.75 | 27.424 |
| 44454.760416666664 | 27.455 |
| 44454.770833333336 | 27.468 |
| 44454.78125 | 27.481 |
| 44454.791666666664 | 27.486 |
| 44454.802083333336 | 27.449 |
| 44454.8125 | 27.457 |
| 44454.822916666664 | 27.463 |
| 44454.833333333336 | 27.431 |
| 44454.84375 | 27.447 |
| 44454.854166666664 | 27.447 |
| 44454.864583333336 | 27.444 |
| 44454.875 | 27.439 |
| 44454.885416666664 | 27.433 |
| 44454.895833333336 | 27.406 |
| 44454.90625 | 27.504 |
| 44454.916666666664 | 27.458 |
| 44454.927083333336 | 27.384 |
| 44454.9375 | 27.452 |
| 44454.947916666664 | 27.559 |
| 44454.958333333336 | 27.631 |
| 44454.96875 | 27.748 |
| 44454.979166666664 | 27.838 |
| 44454.989583333336 | 27.822 |
| 44455.0 | 27.785 |
| 44455.010416666664 | 27.74 |
| 44455.020833333336 | 27.687 |
| 44455.03125 | 27.603 |
| 44455.041666666664 | 27.567 |
| 44455.052083333336 | 27.505 |
| 44455.0625 | 27.456 |
| 44455.072916666664 | 27.432 |
| 44455.083333333336 | 27.348 |
| 44455.09375 | 27.308 |
| 44455.104166666664 | 27.231 |
| 44455.114583333336 | 27.225 |
| 44455.125 | 27.197 |
| 44455.135416666664 | 27.176 |
| 44455.145833333336 | 27.159 |
| 44455.15625 | 27.168 |
| 44455.166666666664 | 27.156 |
| 44455.177083333336 | 27.151 |
| 44455.1875 | 27.164 |
| 44455.197916666664 | 27.12 |
| 44455.208333333336 | 27.055 |
| 44455.21875 | 27.001 |
| 44455.229166666664 | 26.928 |
| 44455.239583333336 | 26.893 |
| 44455.25 | 26.857 |
| 44455.260416666664 | 26.819 |
| 44455.270833333336 | 26.78 |
| 44455.28125 | 26.753 |
| 44455.291666666664 | 26.691 |
| 44455.302083333336 | 26.642 |
| 44455.3125 | 26.601 |
| 44455.322916666664 | 26.558 |
| 44455.333333333336 | 26.532 |
| 44455.34375 | 26.509 |
| 44455.354166666664 | 26.485 |
| 44455.364583333336 | 26.463 |
| 44455.375 | 26.437 |
| 44455.385416666664 | 26.421 |
| 44455.395833333336 | 26.411 |
| 44455.40625 | 26.447 |
| 44455.416666666664 | 26.471 |
| 44455.427083333336 | 26.366 |
| 44455.4375 | 26.298 |
| 44455.447916666664 | 26.139 |
| 44455.458333333336 | 26.129 |
| 44455.46875 | 26.061 |
| 44455.479166666664 | 26.029 |
| 44455.489583333336 | 26.054 |
| 44455.5 | 25.985 |
| 44455.510416666664 | 25.946 |
| 44455.520833333336 | 25.901 |
| 44455.53125 | 25.938 |
| 44455.541666666664 | 25.973 |
| 44455.552083333336 | 26.002 |
| 44455.5625 | 26.081 |
| 44455.572916666664 | 26.121 |
| 44455.583333333336 | 26.147 |
| 44455.59375 | 26.198 |
| 44455.604166666664 | 26.261 |
| 44455.614583333336 | 26.298 |
| 44455.625 | 26.362 |
| 44455.635416666664 | 26.489 |
| 44455.645833333336 | 26.6 |
| 44455.65625 | 26.735 |
| 44455.666666666664 | 26.687 |
| 44455.677083333336 | 26.748 |
| 44455.6875 | 26.747 |
| 44455.697916666664 | 26.827 |
| 44455.708333333336 | 26.917 |
| 44455.71875 | 26.982 |
| 44455.729166666664 | 27.147 |
| 44455.739583333336 | 27.263 |
| 44455.75 | 27.434 |
| 44455.760416666664 | 27.544 |
| 44455.770833333336 | 27.623 |
| 44455.78125 | 27.715 |
| 44455.791666666664 | 27.797 |
| 44455.802083333336 | 27.85 |
| 44455.8125 | 27.884 |
| 44455.822916666664 | 27.924 |
| 44455.833333333336 | 27.926 |
| 44455.84375 | 27.871 |
| 44455.854166666664 | 27.816 |
| 44455.864583333336 | 27.756 |
| 44455.875 | 27.717 |
| 44455.885416666664 | 27.656 |
| 44455.895833333336 | 27.612 |
| 44455.90625 | 27.564 |
| 44455.916666666664 | 27.536 |
| 44455.927083333336 | 27.526 |
| 44455.9375 | 27.645 |
| 44455.947916666664 | 27.61 |
| 44455.958333333336 | 27.576 |
| 44455.96875 | 27.517 |
| 44455.979166666664 | 27.584 |
| 44455.989583333336 | 27.671 |
| 44456.0 | 27.745 |
| 44456.010416666664 | 27.76 |
| 44456.020833333336 | 27.75 |
| 44456.03125 | 27.817 |
| 44456.041666666664 | 27.832 |
| 44456.052083333336 | 27.781 |
| 44456.0625 | 27.702 |
| 44456.072916666664 | 27.662 |
| 44456.083333333336 | 27.594 |
| 44456.09375 | 27.53 |
| 44456.104166666664 | 27.49 |
| 44456.114583333336 | 27.426 |
| 44456.125 | 27.47 |
| 44456.135416666664 | 27.452 |
| 44456.145833333336 | 27.442 |
| 44456.15625 | 27.384 |
| 44456.166666666664 | 27.429 |
| 44456.177083333336 | 27.414 |
| 44456.1875 | 27.387 |
| 44456.197916666664 | 27.353 |
| 44456.208333333336 | 27.347 |
| 44456.21875 | 27.35 |
| 44456.229166666664 | 27.337 |
| 44456.239583333336 | 27.322 |
| 44456.25 | 27.275 |
| 44456.260416666664 | 27.241 |
| 44456.270833333336 | 27.157 |
| 44456.28125 | 27.007 |
| 44456.291666666664 | 26.941 |
| 44456.302083333336 | 26.875 |
| 44456.3125 | 26.809 |
| 44456.322916666664 | 26.73 |
| 44456.333333333336 | 26.667 |
| 44456.34375 | 26.611 |
| 44456.354166666664 | 26.559 |
| 44456.364583333336 | 26.492 |
| 44456.375 | 26.419 |
| 44456.385416666664 | 26.363 |
| 44456.395833333336 | 26.352 |
| 44456.40625 | 26.306 |
| 44456.416666666664 | 26.278 |
| 44456.427083333336 | 26.321 |
| 44456.4375 | 26.365 |
| 44456.447916666664 | 26.275 |
| 44456.458333333336 | 26.232 |
| 44456.46875 | 26.203 |
| 44456.479166666664 | 26.182 |
| 44456.489583333336 | 26.115 |
| 44456.5 | 26.074 |
| 44456.510416666664 | 25.983 |
| 44456.520833333336 | 25.9 |
| 44456.53125 | 25.937 |
| 44456.541666666664 | 25.899 |
| 44456.552083333336 | 25.853 |
| 44456.5625 | 25.838 |
| 44456.572916666664 | 25.879 |
| 44456.583333333336 | 25.938 |
| 44456.59375 | 25.917 |
| 44456.604166666664 | 25.925 |
| 44456.614583333336 | 25.963 |
| 44456.625 | 26.018 |
| 44456.635416666664 | 26.084 |
| 44456.645833333336 | 26.146 |
| 44456.65625 | 26.297 |
| 44456.666666666664 | 26.39 |
| 44456.677083333336 | 26.495 |
| 44456.6875 | 26.625 |
| 44456.697916666664 | 26.684 |
| 44456.708333333336 | 26.657 |
| 44456.71875 | 26.753 |
| 44456.729166666664 | 26.733 |
| 44456.739583333336 | 26.769 |
| 44456.75 | 26.808 |
| 44456.760416666664 | 26.854 |
| 44456.770833333336 | 26.875 |
| 44456.78125 | 26.932 |
| 44456.791666666664 | 27.008 |
| 44456.802083333336 | 27.146 |
| 44456.8125 | 27.189 |
| 44456.822916666664 | 27.17 |
| 44456.833333333336 | 27.154 |
| 44456.84375 | 27.162 |
| 44456.854166666664 | 27.179 |
| 44456.864583333336 | 27.189 |
| 44456.875 | 27.155 |
| 44456.885416666664 | 27.142 |
| 44456.895833333336 | 27.115 |
| 44456.90625 | 27.081 |
| 44456.916666666664 | 27.051 |
| 44456.927083333336 | 26.995 |
| 44456.9375 | 26.932 |
| 44456.947916666664 | 26.894 |
| 44456.958333333336 | 26.833 |
| 44456.96875 | 26.78 |
| 44456.979166666664 | 26.742 |
| 44456.989583333336 | 26.873 |
| 44457.0 | 26.802 |
| 44457.010416666664 | 26.806 |
| 44457.020833333336 | 26.72 |
| 44457.03125 | 26.708 |
| 44457.041666666664 | 26.685 |
| 44457.052083333336 | 26.695 |
| 44457.0625 | 26.65 |
| 44457.072916666664 | 26.624 |
| 44457.083333333336 | 26.576 |
| 44457.09375 | 26.581 |
| 44457.104166666664 | 26.53 |
| 44457.114583333336 | 26.523 |
| 44457.125 | 26.443 |
| 44457.135416666664 | 26.395 |
| 44457.145833333336 | 26.371 |
| 44457.15625 | 26.313 |
| 44457.166666666664 | 26.292 |
| 44457.177083333336 | 26.317 |
| 44457.1875 | 26.367 |
| 44457.197916666664 | 26.382 |
| 44457.208333333336 | 26.392 |
| 44457.21875 | 26.492 |
| 44457.229166666664 | 26.485 |
| 44457.239583333336 | 26.458 |
| 44457.25 | 26.397 |
| 44457.260416666664 | 26.372 |
| 44457.270833333336 | 26.397 |
| 44457.28125 | 26.379 |
| 44457.291666666664 | 26.317 |
| 44457.302083333336 | 26.253 |
| 44457.3125 | 26.163 |
| 44457.322916666664 | 25.96 |
| 44457.333333333336 | 25.822 |
| 44457.34375 | 25.8 |
| 44457.354166666664 | 25.802 |
| 44457.364583333336 | 25.742 |
| 44457.375 | 25.714 |
| 44457.385416666664 | 25.706 |
| 44457.395833333336 | 25.709 |
| 44457.40625 | 25.697 |
| 44457.416666666664 | 25.688 |
| 44457.427083333336 | 25.671 |
| 44457.4375 | 25.655 |
| 44457.447916666664 | 25.631 |
| 44457.458333333336 | 25.606 |
| 44457.46875 | 25.594 |
| 44457.479166666664 | 25.623 |
| 44457.489583333336 | 25.679 |
| 44457.5 | 25.609 |
| 44457.510416666664 | 25.561 |
| 44457.520833333336 | 25.481 |
| 44457.53125 | 25.439 |
| 44457.541666666664 | 25.413 |
| 44457.552083333336 | 25.285 |
| 44457.5625 | 25.23 |
| 44457.572916666664 | 25.303 |
| 44457.583333333336 | 25.375 |
| 44457.59375 | 25.509 |
| 44457.604166666664 | 25.455 |
| 44457.614583333336 | 25.663 |
| 44457.625 | 25.7 |
| 44457.635416666664 | 25.923 |
| 44457.645833333336 | 25.901 |
| 44457.65625 | 26.157 |
| 44457.666666666664 | 26.26 |
| 44457.677083333336 | 26.388 |
| 44457.6875 | 26.606 |
| 44457.697916666664 | 26.7 |
| 44457.708333333336 | 26.813 |
| 44457.71875 | 26.893 |
| 44457.729166666664 | 26.974 |
| 44457.739583333336 | 27.026 |
| 44457.75 | 26.91 |
| 44457.760416666664 | 26.883 |
| 44457.770833333336 | 26.839 |
| 44457.78125 | 26.809 |
| 44457.791666666664 | 26.768 |
| 44457.802083333336 | 26.791 |
| 44457.8125 | 26.81 |
| 44457.822916666664 | 26.87 |
| 44457.833333333336 | 26.941 |
| 44457.84375 | 27.016 |
| 44457.854166666664 | 27.083 |
| 44457.864583333336 | 27.117 |
| 44457.875 | 27.152 |
| 44457.885416666664 | 27.175 |
| 44457.895833333336 | 27.193 |
| 44457.90625 | 27.18 |
| 44457.916666666664 | 27.115 |
| 44457.927083333336 | 27.028 |
| 44457.9375 | 26.923 |
| 44457.947916666664 | 26.826 |
| 44457.958333333336 | 26.756 |
| 44457.96875 | 26.66 |
| 44457.979166666664 | 26.641 |
| 44457.989583333336 | 26.585 |
| 44458.0 | 26.544 |
| 44458.010416666664 | 26.524 |
| 44458.020833333336 | 26.596 |
| 44458.03125 | 26.59 |
| 44458.041666666664 | 26.564 |
| 44458.052083333336 | 26.638 |
| 44458.0625 | 26.655 |
| 44458.072916666664 | 26.73 |
| 44458.083333333336 | 26.737 |
| 44458.09375 | 26.711 |
| 44458.104166666664 | 26.739 |
| 44458.114583333336 | 26.736 |
| 44458.125 | 26.695 |
| 44458.135416666664 | 26.679 |
| 44458.145833333336 | 26.601 |
| 44458.15625 | 26.617 |
| 44458.166666666664 | 26.457 |
| 44458.177083333336 | 26.552 |
| 44458.1875 | 26.418 |
| 44458.197916666664 | 26.561 |
| 44458.208333333336 | 26.581 |
| 44458.21875 | 26.65 |
| 44458.229166666664 | 26.574 |
| 44458.239583333336 | 26.69 |
| 44458.25 | 26.648 |
| 44458.260416666664 | 26.722 |
| 44458.270833333336 | 26.732 |
| 44458.28125 | 26.661 |
| 44458.291666666664 | 26.587 |
| 44458.302083333336 | 26.64 |
| 44458.3125 | 26.633 |
| 44458.322916666664 | 26.547 |
| 44458.333333333336 | 26.488 |
| 44458.34375 | 26.374 |
| 44458.354166666664 | 26.109 |
| 44458.364583333336 | 25.999 |
| 44458.375 | 25.963 |
| 44458.385416666664 | 25.963 |
| 44458.395833333336 | 25.917 |
| 44458.40625 | 25.911 |
| 44458.416666666664 | 25.89 |
| 44458.427083333336 | 25.879 |
| 44458.4375 | 25.854 |
| 44458.447916666664 | 25.827 |
| 44458.458333333336 | 25.776 |
| 44458.46875 | 25.726 |
| 44458.479166666664 | 25.686 |
| 44458.489583333336 | 25.646 |
| 44458.5 | 25.634 |
| 44458.510416666664 | 25.707 |
| 44458.520833333336 | 25.746 |
| 44458.53125 | 25.751 |
| 44458.541666666664 | 25.691 |
| 44458.552083333336 | 25.651 |
| 44458.5625 | 25.723 |
| 44458.572916666664 | 25.794 |
| 44458.583333333336 | 25.811 |
| 44458.59375 | 25.898 |
| 44458.604166666664 | 25.89 |
| 44458.614583333336 | 26.02 |
| 44458.625 | 26.18 |
| 44458.635416666664 | 26.293 |
| 44458.645833333336 | 26.501 |
| 44458.65625 | 26.574 |
| 44458.666666666664 | 26.682 |
| 44458.677083333336 | 26.796 |
| 44458.6875 | 26.899 |
| 44458.697916666664 | 27.075 |
| 44458.708333333336 | 27.197 |
| 44458.71875 | 27.337 |
| 44458.729166666664 | 27.542 |
| 44458.739583333336 | 27.778 |
| 44458.75 | 27.868 |
| 44458.760416666664 | 27.948 |
| 44458.770833333336 | 27.836 |
| 44458.78125 | 27.812 |
| 44458.791666666664 | 27.714 |
| 44458.802083333336 | 27.669 |
| 44458.8125 | 27.629 |
| 44458.822916666664 | 27.613 |
| 44458.833333333336 | 27.59 |
| 44458.84375 | 27.531 |
| 44458.854166666664 | 27.5 |
| 44458.864583333336 | 27.463 |
| 44458.875 | 27.459 |
| 44458.885416666664 | 27.446 |
| 44458.895833333336 | 27.42 |
| 44458.90625 | 27.372 |
| 44458.916666666664 | 27.351 |
| 44458.927083333336 | 27.308 |
| 44458.9375 | 27.243 |
| 44458.947916666664 | 27.175 |
| 44458.958333333336 | 27.039 |
| 44458.96875 | 26.95 |
| 44458.979166666664 | 26.841 |
| 44458.989583333336 | 26.745 |
| 44459.0 | 26.665 |
| 44459.010416666664 | 26.583 |
| 44459.020833333336 | 26.491 |
| 44459.03125 | 26.464 |
| 44459.041666666664 | 26.55 |
| 44459.052083333336 | 26.704 |
| 44459.0625 | 26.543 |
| 44459.072916666664 | 26.209 |
| 44459.083333333336 | 26.111 |
| 44459.09375 | 26.072 |
| 44459.104166666664 | 26.017 |
| 44459.114583333336 | 25.936 |
| 44459.125 | 25.847 |
| 44459.135416666664 | 25.773 |
| 44459.145833333336 | 25.649 |
| 44459.15625 | 25.585 |
| 44459.166666666664 | 25.504 |
| 44459.177083333336 | 25.47 |
| 44459.1875 | 25.371 |
| 44459.197916666664 | 25.463 |
| 44459.208333333336 | 25.448 |
| 44459.21875 | 25.415 |
| 44459.229166666664 | 25.378 |
| 44459.239583333336 | 25.461 |
| 44459.25 | 25.438 |
| 44459.260416666664 | 25.494 |
| 44459.270833333336 | 25.474 |
| 44459.28125 | 25.52 |
| 44459.291666666664 | 25.516 |
| 44459.302083333336 | 25.482 |
| 44459.3125 | 25.397 |
| 44459.322916666664 | 25.395 |
| 44459.333333333336 | 25.451 |
| 44459.34375 | 25.434 |
| 44459.354166666664 | 25.335 |
| 44459.364583333336 | 25.246 |
| 44459.375 | 25.075 |
| 44459.385416666664 | 24.925 |
| 44459.395833333336 | 24.83 |
| 44459.40625 | 24.761 |
| 44459.416666666664 | 24.66 |
| 44459.427083333336 | 24.612 |
| 44459.4375 | 24.595 |
| 44459.447916666664 | 24.56 |
| 44459.458333333336 | 24.535 |
| 44459.46875 | 24.521 |
| 44459.479166666664 | 24.509 |
| 44459.489583333336 | 24.513 |
| 44459.5 | 24.524 |
| 44459.510416666664 | 24.524 |
| 44459.520833333336 | 24.524 |
| 44459.53125 | 24.527 |
| 44459.541666666664 | 24.521 |
| 44459.552083333336 | 24.555 |
| 44459.5625 | 24.685 |
| 44459.572916666664 | 24.62 |
| 44459.583333333336 | 24.615 |
| 44459.59375 | 24.672 |
| 44459.604166666664 | 24.717 |
| 44459.614583333336 | 24.745 |
| 44459.625 | 24.813 |
| 44459.635416666664 | 24.886 |
| 44459.645833333336 | 24.986 |
| 44459.65625 | 25.172 |
| 44459.666666666664 | 25.441 |
| 44459.677083333336 | 25.567 |
| 44459.6875 | 25.712 |
| 44459.697916666664 | 25.779 |
| 44459.708333333336 | 25.925 |
| 44459.71875 | 26.015 |
| 44459.729166666664 | 26.137 |
| 44459.739583333336 | 26.232 |
| 44459.75 | 26.37 |
| 44459.760416666664 | 26.489 |
| 44459.770833333336 | 26.479 |
| 44459.78125 | 26.485 |
| 44459.791666666664 | 26.544 |
| 44459.802083333336 | 26.531 |
| 44459.8125 | 26.524 |
| 44459.822916666664 | 26.459 |
| 44459.833333333336 | 26.385 |
| 44459.84375 | 26.311 |
| 44459.854166666664 | 26.24 |
| 44459.864583333336 | 26.215 |
| 44459.875 | 26.159 |
| 44459.885416666664 | 26.082 |
| 44459.895833333336 | 26.037 |
| 44459.90625 | 25.954 |
| 44459.916666666664 | 25.851 |
| 44459.927083333336 | 25.769 |
| 44459.9375 | 25.709 |
| 44459.947916666664 | 25.648 |
| 44459.958333333336 | 25.589 |
| 44459.96875 | 25.532 |
| 44459.979166666664 | 25.474 |
| 44459.989583333336 | 25.425 |
| 44460.0 | 25.357 |
| 44460.010416666664 | 25.298 |
| 44460.020833333336 | 25.243 |
| 44460.03125 | 25.196 |
| 44460.041666666664 | 25.105 |
| 44460.052083333336 | 25.088 |
| 44460.0625 | 25.073 |
| 44460.072916666664 | 25.354 |
| 44460.083333333336 | 25.069 |
| 44460.09375 | 25.012 |
| 44460.104166666664 | 24.968 |
| 44460.114583333336 | 24.961 |
| 44460.125 | 24.953 |
| 44460.135416666664 | 24.871 |
| 44460.145833333336 | 24.843 |
| 44460.15625 | 24.761 |
| 44460.166666666664 | 24.695 |
| 44460.177083333336 | 24.618 |
| 44460.1875 | 24.587 |
| 44460.197916666664 | 24.572 |
| 44460.208333333336 | 24.521 |
| 44460.21875 | 24.52 |
| 44460.229166666664 | 24.5 |
| 44460.239583333336 | 24.411 |
| 44460.25 | 24.39 |
| 44460.260416666664 | 24.442 |
| 44460.270833333336 | 24.426 |
| 44460.28125 | 24.473 |
| 44460.291666666664 | 24.491 |
| 44460.302083333336 | 24.501 |
| 44460.3125 | 24.521 |
| 44460.322916666664 | 24.541 |
| 44460.333333333336 | 24.536 |
| 44460.34375 | 24.487 |
| 44460.354166666664 | 24.469 |
| 44460.364583333336 | 24.48 |
| 44460.375 | 24.443 |
| 44460.385416666664 | 24.373 |
| 44460.395833333336 | 24.323 |
| 44460.40625 | 24.261 |
| 44460.416666666664 | 24.211 |
| 44460.427083333336 | 24.181 |
| 44460.4375 | 24.138 |
| 44460.447916666664 | 24.111 |
| 44460.458333333336 | 24.091 |
| 44460.46875 | 24.074 |
| 44460.479166666664 | 24.061 |
| 44460.489583333336 | 24.058 |
| 44460.5 | 24.066 |
| 44460.510416666664 | 24.086 |
| 44460.520833333336 | 24.119 |
| 44460.53125 | 24.152 |
| 44460.541666666664 | 24.192 |
| 44460.552083333336 | 24.22 |
| 44460.5625 | 24.245 |
| 44460.572916666664 | 24.273 |
| 44460.583333333336 | 24.322 |
| 44460.59375 | 24.38 |
| 44460.604166666664 | 24.358 |
| 44460.614583333336 | 24.457 |
| 44460.625 | 24.615 |
| 44460.635416666664 | 24.76 |
| 44460.645833333336 | 24.937 |
| 44460.65625 | 25.02 |
| 44460.666666666664 | 25.217 |
| 44460.677083333336 | 25.257 |
| 44460.6875 | 25.52 |
| 44460.697916666664 | 25.678 |
| 44460.708333333336 | 25.723 |
| 44460.71875 | 26.057 |
| 44460.729166666664 | 26.058 |
| 44460.739583333336 | 26.188 |
| 44460.75 | 26.207 |
| 44460.760416666664 | 26.333 |
| 44460.770833333336 | 26.429 |
| 44460.78125 | 26.472 |
| 44460.791666666664 | 26.543 |
| 44460.802083333336 | 26.592 |
| 44460.8125 | 26.67 |
| 44460.822916666664 | 26.751 |
| 44460.833333333336 | 26.851 |
| 44460.84375 | 26.763 |
| 44460.854166666664 | 26.67 |
| 44460.864583333336 | 26.623 |
| 44460.875 | 26.552 |
| 44460.885416666664 | 26.502 |
| 44460.895833333336 | 26.489 |
| 44460.90625 | 26.43 |
| 44460.916666666664 | 26.378 |
| 44460.927083333336 | 26.319 |
| 44460.9375 | 26.285 |
| 44460.947916666664 | 26.256 |
| 44460.958333333336 | 26.203 |
| 44460.96875 | 26.13 |
| 44460.979166666664 | 26.066 |
| 44460.989583333336 | 26.022 |
| 44461.0 | 25.985 |
| 44461.010416666664 | 25.935 |
| 44461.020833333336 | 25.877 |
| 44461.03125 | 25.815 |
| 44461.041666666664 | 25.754 |
| 44461.052083333336 | 25.681 |
| 44461.0625 | 25.639 |
| 44461.072916666664 | 25.59 |
| 44461.083333333336 | 25.573 |
| 44461.09375 | 25.706 |
| 44461.104166666664 | 25.704 |
| 44461.114583333336 | 25.785 |
| 44461.125 | 25.469 |
| 44461.135416666664 | 25.557 |
| 44461.145833333336 | 25.426 |
| 44461.15625 | 25.446 |
| 44461.166666666664 | 25.441 |
| 44461.177083333336 | 25.458 |
| 44461.1875 | 25.395 |
| 44461.197916666664 | 25.393 |
| 44461.208333333336 | 25.379 |
| 44461.21875 | 25.32 |
| 44461.229166666664 | 25.31 |
| 44461.239583333336 | 25.293 |
| 44461.25 | 25.306 |
| 44461.260416666664 | 25.328 |
| 44461.270833333336 | 25.336 |
| 44461.28125 | 25.336 |
| 44461.291666666664 | 25.365 |
| 44461.302083333336 | 25.399 |
| 44461.3125 | 25.433 |
| 44461.322916666664 | 25.451 |
| 44461.333333333336 | 25.456 |
| 44461.34375 | 25.465 |
| 44461.354166666664 | 25.442 |
| 44461.364583333336 | 25.36 |
| 44461.375 | 25.395 |
| 44461.385416666664 | 25.365 |
| 44461.395833333336 | 25.296 |
| 44461.40625 | 25.244 |
| 44461.416666666664 | 25.17 |
| 44461.427083333336 | 25.108 |
| 44461.4375 | 25.073 |
| 44461.447916666664 | 25.049 |
| 44461.458333333336 | 25.018 |
| 44461.46875 | 24.977 |
| 44461.479166666664 | 24.932 |
| 44461.489583333336 | 24.931 |
| 44461.5 | 24.908 |
| 44461.510416666664 | 24.903 |
| 44461.520833333336 | 24.909 |
| 44461.53125 | 24.915 |
| 44461.541666666664 | 24.911 |
| 44461.552083333336 | 24.898 |
| 44461.5625 | 24.91 |
| 44461.572916666664 | 24.921 |
| 44461.583333333336 | 24.946 |
| 44461.59375 | 24.897 |
| 44461.604166666664 | 24.923 |
| 44461.614583333336 | 24.989 |
| 44461.625 | 25.023 |
| 44461.635416666664 | 25.126 |
| 44461.645833333336 | 25.309 |
| 44461.65625 | 25.522 |
| 44461.666666666664 | 25.533 |
| 44461.677083333336 | 25.822 |
| 44461.6875 | 25.94 |
| 44461.697916666664 | 26.038 |
| 44461.708333333336 | 26.161 |
| 44461.71875 | 26.333 |
| 44461.729166666664 | 26.484 |
| 44461.739583333336 | 26.727 |
| 44461.75 | 26.822 |
| 44461.760416666664 | 26.942 |
| 44461.770833333336 | 26.937 |
| 44461.78125 | 26.936 |
| 44461.791666666664 | 26.846 |
| 44461.802083333336 | 26.871 |
| 44461.8125 | 26.766 |
| 44461.822916666664 | 26.77 |
| 44461.833333333336 | 26.748 |
| 44461.84375 | 26.737 |
| 44461.854166666664 | 26.723 |
| 44461.864583333336 | 26.723 |
| 44461.875 | 26.694 |
| 44461.885416666664 | 26.66 |
| 44461.895833333336 | 26.614 |
| 44461.90625 | 26.538 |
| 44461.916666666664 | 26.485 |
| 44461.927083333336 | 26.358 |
| 44461.9375 | 26.208 |
| 44461.947916666664 | 26.13 |
| 44461.958333333336 | 26.054 |
| 44461.96875 | 25.951 |
| 44461.979166666664 | 25.902 |
| 44461.989583333336 | 25.844 |
| 44462.0 | 25.791 |
| 44462.010416666664 | 25.772 |
| 44462.020833333336 | 25.737 |
| 44462.03125 | 25.668 |
| 44462.041666666664 | 25.622 |
| 44462.052083333336 | 25.572 |
| 44462.0625 | 25.555 |
| 44462.072916666664 | 25.507 |
| 44462.083333333336 | 25.485 |
| 44462.09375 | 25.454 |
| 44462.104166666664 | 25.442 |
| 44462.114583333336 | 25.401 |
| 44462.125 | 25.391 |
| 44462.135416666664 | 25.37 |
| 44462.145833333336 | 25.437 |
| 44462.15625 | 25.44 |
| 44462.166666666664 | 25.292 |
| 44462.177083333336 | 25.276 |
| 44462.1875 | 25.196 |
| 44462.197916666664 | 25.13 |
| 44462.208333333336 | 25.086 |
| 44462.21875 | 25.024 |
| 44462.229166666664 | 25.002 |
| 44462.239583333336 | 24.947 |
| 44462.25 | 24.969 |
| 44462.260416666664 | 24.976 |
| 44462.270833333336 | 24.955 |
| 44462.28125 | 24.918 |
| 44462.291666666664 | 24.914 |
| 44462.302083333336 | 24.908 |
| 44462.3125 | 24.928 |
| 44462.322916666664 | 24.96 |
| 44462.333333333336 | 24.97 |
| 44462.34375 | 24.96 |
| 44462.354166666664 | 24.955 |
| 44462.364583333336 | 24.939 |
| 44462.375 | 24.916 |
| 44462.385416666664 | 24.913 |
| 44462.395833333336 | 24.893 |
| 44462.40625 | 24.858 |
| 44462.416666666664 | 24.793 |
| 44462.427083333336 | 24.759 |
| 44462.4375 | 24.715 |
| 44462.447916666664 | 24.705 |
| 44462.458333333336 | 24.694 |
| 44462.46875 | 24.675 |
| 44462.479166666664 | 24.677 |
| 44462.489583333336 | 24.684 |
| 44462.5 | 24.686 |
| 44462.510416666664 | 24.69 |
| 44462.520833333336 | 24.704 |
| 44462.53125 | 24.713 |
| 44462.541666666664 | 24.72 |
| 44462.552083333336 | 24.741 |
| 44462.5625 | 24.765 |
| 44462.572916666664 | 24.772 |
| 44462.583333333336 | 24.783 |
| 44462.59375 | 24.798 |
| 44462.604166666664 | 24.801 |
| 44462.614583333336 | 24.811 |
| 44462.625 | 24.814 |
| 44462.635416666664 | 24.834 |
| 44462.645833333336 | 24.854 |
| 44462.65625 | 24.875 |
| 44462.666666666664 | 24.914 |
| 44462.677083333336 | 24.866 |
| 44462.6875 | 24.916 |
| 44462.697916666664 | 24.93 |
| 44462.708333333336 | 24.939 |
| 44462.71875 | 24.889 |
| 44462.729166666664 | 24.869 |
| 44462.739583333336 | 24.855 |
| 44462.75 | 24.853 |
| 44462.760416666664 | 24.829 |
| 44462.770833333336 | 24.827 |
| 44462.78125 | 24.797 |
| 44462.791666666664 | 24.77 |
| 44462.802083333336 | 24.751 |
| 44462.8125 | 24.734 |
| 44462.822916666664 | 24.734 |
| 44462.833333333336 | 24.705 |
| 44462.84375 | 24.687 |
| 44462.854166666664 | 24.689 |
| 44462.864583333336 | 24.72 |
| 44462.875 | 24.693 |
| 44462.885416666664 | 24.689 |
| 44462.895833333336 | 24.666 |
| 44462.90625 | 24.701 |
| 44462.916666666664 | 24.651 |
| 44462.927083333336 | 24.645 |
| 44462.9375 | 24.655 |
| 44462.947916666664 | 24.647 |
| 44462.958333333336 | 24.635 |
| 44462.96875 | 24.621 |
| 44462.979166666664 | 24.6 |
| 44462.989583333336 | 24.584 |
| 44463.0 | 24.557 |
| 44463.010416666664 | 24.528 |
| 44463.020833333336 | 24.5 |
| 44463.03125 | 24.47 |
| 44463.041666666664 | 24.451 |
| 44463.052083333336 | 24.433 |
| 44463.0625 | 24.424 |
| 44463.072916666664 | 24.407 |
| 44463.083333333336 | 24.384 |
| 44463.09375 | 24.361 |
| 44463.104166666664 | 24.351 |
| 44463.114583333336 | 24.345 |
| 44463.125 | 24.347 |
| 44463.135416666664 | 24.34 |
| 44463.145833333336 | 24.323 |
| 44463.15625 | 24.335 |
| 44463.166666666664 | 24.316 |
| 44463.177083333336 | 24.247 |
| 44463.1875 | 24.189 |
| 44463.197916666664 | 24.093 |
| 44463.208333333336 | 23.99 |
| 44463.21875 | 23.969 |
| 44463.229166666664 | 23.959 |
| 44463.239583333336 | 23.633 |
| 44463.25 | 23.622 |
| 44463.260416666664 | 23.428 |
| 44463.270833333336 | 23.494 |
| 44463.28125 | 23.352 |
| 44463.291666666664 | 23.316 |
| 44463.302083333336 | 23.226 |
| 44463.3125 | 23.219 |
| 44463.322916666664 | 23.211 |
| 44463.333333333336 | 23.309 |
| 44463.34375 | 23.229 |
| 44463.354166666664 | 23.265 |
| 44463.364583333336 | 23.255 |
| 44463.375 | 23.246 |
| 44463.385416666664 | 23.26 |
| 44463.395833333336 | 23.256 |
| 44463.40625 | 23.197 |
| 44463.416666666664 | 23.252 |
| 44463.427083333336 | 23.213 |
| 44463.4375 | 23.191 |
| 44463.447916666664 | 23.175 |
| 44463.458333333336 | 23.143 |
| 44463.46875 | 23.088 |
| 44463.479166666664 | 23.05 |
| 44463.489583333336 | 22.988 |
| 44463.5 | 22.912 |
| 44463.510416666664 | 22.828 |
| 44463.520833333336 | 22.767 |
| 44463.53125 | 22.74 |
| 44463.541666666664 | 22.737 |
| 44463.552083333336 | 22.731 |
| 44463.5625 | 22.741 |
| 44463.572916666664 | 22.772 |
| 44463.583333333336 | 22.858 |
| 44463.59375 | 22.946 |
| 44463.604166666664 | 23.034 |
| 44463.614583333336 | 23.101 |
| 44463.625 | 23.176 |
| 44463.635416666664 | 23.269 |
| 44463.645833333336 | 23.312 |
| 44463.65625 | 23.319 |
| 44463.666666666664 | 23.405 |
| 44463.677083333336 | 23.492 |
| 44463.6875 | 23.541 |
| 44463.697916666664 | 23.682 |
| 44463.708333333336 | 23.747 |
| 44463.71875 | 23.875 |
| 44463.729166666664 | 23.975 |
| 44463.739583333336 | 23.942 |
| 44463.75 | 24.035 |
| 44463.760416666664 | 24.183 |
| 44463.770833333336 | 24.187 |
| 44463.78125 | 24.296 |
| 44463.791666666664 | 24.333 |
| 44463.802083333336 | 24.552 |
| 44463.8125 | 24.718 |
| 44463.822916666664 | 24.69 |
| 44463.833333333336 | 24.705 |
| 44463.84375 | 24.757 |
| 44463.854166666664 | 24.778 |
| 44463.864583333336 | 24.794 |
| 44463.875 | 24.831 |
| 44463.885416666664 | 24.82 |
| 44463.895833333336 | 24.8 |
| 44463.90625 | 24.732 |
| 44463.916666666664 | 24.625 |
| 44463.927083333336 | 24.596 |
| 44463.9375 | 24.593 |
| 44463.947916666664 | 24.557 |
| 44463.958333333336 | 24.51 |
| 44463.96875 | 24.464 |
| 44463.979166666664 | 24.429 |
| 44463.989583333336 | 24.409 |
| 44464.0 | 24.332 |
| 44464.010416666664 | 24.216 |
| 44464.020833333336 | 24.073 |
| 44464.03125 | 24.022 |
| 44464.041666666664 | 23.962 |
| 44464.052083333336 | 23.936 |
| 44464.0625 | 23.902 |
| 44464.072916666664 | 23.865 |
| 44464.083333333336 | 23.831 |
| 44464.09375 | 23.801 |
| 44464.104166666664 | 23.775 |
| 44464.114583333336 | 23.741 |
| 44464.125 | 23.717 |
| 44464.135416666664 | 23.69 |
| 44464.145833333336 | 23.655 |
| 44464.15625 | 23.636 |
| 44464.166666666664 | 23.615 |
| 44464.177083333336 | 23.628 |
| 44464.1875 | 23.577 |
| 44464.197916666664 | 23.496 |
| 44464.208333333336 | 23.354 |
| 44464.21875 | 23.281 |
| 44464.229166666664 | 23.093 |
| 44464.239583333336 | 22.941 |
| 44464.25 | 22.832 |
| 44464.260416666664 | 22.815 |
| 44464.270833333336 | 22.676 |
| 44464.28125 | 22.481 |
| 44464.291666666664 | 22.247 |
| 44464.302083333336 | 22.434 |
| 44464.3125 | 22.172 |
| 44464.322916666664 | 22.231 |
| 44464.333333333336 | 22.16 |
| 44464.34375 | 22.196 |
| 44464.354166666664 | 22.078 |
| 44464.364583333336 | 22.065 |
| 44464.375 | 21.984 |
| 44464.385416666664 | 22.069 |
| 44464.395833333336 | 22.033 |
| 44464.40625 | 21.992 |
| 44464.416666666664 | 21.989 |
| 44464.427083333336 | 21.984 |
| 44464.4375 | 22.021 |
| 44464.447916666664 | 21.987 |
| 44464.458333333336 | 21.987 |
| 44464.46875 | 22.007 |
| 44464.479166666664 | 21.96 |
| 44464.489583333336 | 21.947 |
| 44464.5 | 21.966 |
| 44464.510416666664 | 21.998 |
| 44464.520833333336 | 21.996 |
| 44464.53125 | 21.957 |
| 44464.541666666664 | 21.922 |
| 44464.552083333336 | 21.895 |
| 44464.5625 | 21.889 |
| 44464.572916666664 | 21.915 |
| 44464.583333333336 | 21.947 |
| 44464.59375 | 22.006 |
| 44464.604166666664 | 22.072 |
| 44464.614583333336 | 22.15 |
| 44464.625 | 22.312 |
| 44464.635416666664 | 22.426 |
| 44464.645833333336 | 22.573 |
| 44464.65625 | 22.761 |
| 44464.666666666664 | 22.893 |
| 44464.677083333336 | 22.994 |
| 44464.6875 | 23.097 |
| 44464.697916666664 | 23.173 |
| 44464.708333333336 | 23.271 |
| 44464.71875 | 23.364 |
| 44464.729166666664 | 23.63 |
| 44464.739583333336 | 23.785 |
| 44464.75 | 23.936 |
| 44464.760416666664 | 23.814 |
| 44464.770833333336 | 23.848 |
| 44464.78125 | 23.949 |
| 44464.791666666664 | 23.981 |
| 44464.802083333336 | 24.085 |
| 44464.8125 | 24.312 |
| 44464.822916666664 | 24.428 |
| 44464.833333333336 | 24.304 |
| 44464.84375 | 24.392 |
| 44464.854166666664 | 24.469 |
| 44464.864583333336 | 24.489 |
| 44464.875 | 24.469 |
| 44464.885416666664 | 24.488 |
| 44464.895833333336 | 24.44 |
| 44464.90625 | 24.439 |
| 44464.916666666664 | 24.357 |
| 44464.927083333336 | 24.292 |
| 44464.9375 | 24.271 |
| 44464.947916666664 | 24.195 |
| 44464.958333333336 | 24.214 |
| 44464.96875 | 24.15 |
| 44464.979166666664 | 24.098 |
| 44464.989583333336 | 24.068 |
| 44465.0 | 24.051 |
| 44465.010416666664 | 24.051 |
| 44465.020833333336 | 24.01 |
| 44465.03125 | 23.955 |
| 44465.041666666664 | 23.852 |
| 44465.052083333336 | 23.718 |
| 44465.0625 | 23.647 |
| 44465.072916666664 | 23.594 |
| 44465.083333333336 | 23.583 |
| 44465.09375 | 23.573 |
| 44465.104166666664 | 23.535 |
| 44465.114583333336 | 23.496 |
| 44465.125 | 23.46 |
| 44465.135416666664 | 23.416 |
| 44465.145833333336 | 23.382 |
| 44465.15625 | 23.355 |
| 44465.166666666664 | 23.324 |
| 44465.177083333336 | 23.299 |
| 44465.1875 | 23.281 |
| 44465.197916666664 | 23.251 |
| 44465.208333333336 | 23.271 |
| 44465.21875 | 23.165 |
| 44465.229166666664 | 23.088 |
| 44465.239583333336 | 22.978 |
| 44465.25 | 22.822 |
| 44465.260416666664 | 22.54 |
| 44465.270833333336 | 22.56 |
| 44465.28125 | 22.543 |
| 44465.291666666664 | 22.255 |
| 44465.302083333336 | 22.279 |
| 44465.3125 | 22.229 |
| 44465.322916666664 | 22.119 |
| 44465.333333333336 | 22.144 |
| 44465.34375 | 22.051 |
| 44465.354166666664 | 22.009 |
| 44465.364583333336 | 21.949 |
| 44465.375 | 21.925 |
| 44465.385416666664 | 21.912 |
| 44465.395833333336 | 21.771 |
| 44465.40625 | 21.819 |
| 44465.416666666664 | 21.815 |
| 44465.427083333336 | 21.798 |
| 44465.4375 | 21.783 |
| 44465.447916666664 | 21.802 |
| 44465.458333333336 | 21.775 |
| 44465.46875 | 21.82 |
| 44465.479166666664 | 21.81 |
| 44465.489583333336 | 21.794 |
| 44465.5 | 21.827 |
| 44465.510416666664 | 21.833 |
| 44465.520833333336 | 21.835 |
| 44465.53125 | 21.866 |
| 44465.541666666664 | 21.902 |
| 44465.552083333336 | 21.957 |
| 44465.5625 | 21.983 |
| 44465.572916666664 | 21.978 |
| 44465.583333333336 | 21.957 |
| 44465.59375 | 21.947 |
| 44465.604166666664 | 21.969 |
| 44465.614583333336 | 22.003 |
| 44465.625 | 22.03 |
| 44465.635416666664 | 22.08 |
| 44465.645833333336 | 22.127 |
| 44465.65625 | 22.212 |
| 44465.666666666664 | 22.298 |
| 44465.677083333336 | 22.387 |
| 44465.6875 | 22.47 |
| 44465.697916666664 | 22.587 |
| 44465.708333333336 | 22.668 |
| 44465.71875 | 22.741 |
| 44465.729166666664 | 22.695 |
| 44465.739583333336 | 22.87 |
| 44465.75 | 22.928 |
| 44465.760416666664 | 23.001 |
| 44465.770833333336 | 23.053 |
| 44465.78125 | 23.165 |
| 44465.791666666664 | 23.168 |
| 44465.802083333336 | 23.278 |
| 44465.8125 | 23.349 |
| 44465.822916666664 | 23.443 |
| 44465.833333333336 | 23.53 |
| 44465.84375 | 23.657 |
| 44465.854166666664 | 23.683 |
| 44465.864583333336 | 23.66 |
| 44465.875 | 23.61 |
| 44465.885416666664 | 23.531 |
| 44465.895833333336 | 23.535 |
| 44465.90625 | 23.548 |
| 44465.916666666664 | 23.488 |
| 44465.927083333336 | 23.542 |
| 44465.9375 | 23.473 |
| 44465.947916666664 | 23.393 |
| 44465.958333333336 | 23.313 |
| 44465.96875 | 23.39 |
| 44465.979166666664 | 23.303 |
| 44465.989583333336 | 23.216 |
| 44466.0 | 23.242 |
| 44466.010416666664 | 23.194 |
| 44466.020833333336 | 23.18 |
| 44466.03125 | 23.141 |
| 44466.041666666664 | 23.123 |
| 44466.052083333336 | 23.112 |
| 44466.0625 | 23.092 |
| 44466.072916666664 | 23.067 |
| 44466.083333333336 | 23.022 |
| 44466.09375 | 22.971 |
| 44466.104166666664 | 22.871 |
| 44466.114583333336 | 22.719 |
| 44466.125 | 22.681 |
| 44466.135416666664 | 22.642 |
| 44466.145833333336 | 22.63 |
| 44466.15625 | 22.614 |
| 44466.166666666664 | 22.596 |
| 44466.177083333336 | 22.564 |
| 44466.1875 | 22.539 |
| 44466.197916666664 | 22.512 |
| 44466.208333333336 | 22.499 |
| 44466.21875 | 22.483 |
| 44466.229166666664 | 22.419 |
| 44466.239583333336 | 22.331 |
| 44466.25 | 22.245 |
| 44466.260416666664 | 22.155 |
| 44466.270833333336 | 22.11 |
| 44466.28125 | 21.748 |
| 44466.291666666664 | 21.943 |
| 44466.302083333336 | 21.907 |
| 44466.3125 | 21.523 |
| 44466.322916666664 | 21.508 |
| 44466.333333333336 | 21.404 |
| 44466.34375 | 21.297 |
| 44466.354166666664 | 21.182 |
| 44466.364583333336 | 21.06 |
| 44466.375 | 21.134 |
| 44466.385416666664 | 21.111 |
| 44466.395833333336 | 20.949 |
| 44466.40625 | 20.907 |
| 44466.416666666664 | 20.936 |
| 44466.427083333336 | 20.917 |
| 44466.4375 | 20.881 |
| 44466.447916666664 | 20.844 |
| 44466.458333333336 | 20.826 |
| 44466.46875 | 20.815 |
| 44466.479166666664 | 20.812 |
| 44466.489583333336 | 20.85 |
| 44466.5 | 20.846 |
| 44466.510416666664 | 20.923 |
| 44466.520833333336 | 20.856 |
| 44466.53125 | 20.9 |
| 44466.541666666664 | 20.952 |
| 44466.552083333336 | 20.977 |
| 44466.5625 | 21.061 |
| 44466.572916666664 | 21.157 |
| 44466.583333333336 | 21.235 |
| 44466.59375 | 21.307 |
| 44466.604166666664 | 21.385 |
| 44466.614583333336 | 21.465 |
| 44466.625 | 21.541 |
| 44466.635416666664 | 21.665 |
| 44466.645833333336 | 21.761 |
| 44466.65625 | 21.893 |
| 44466.666666666664 | 21.956 |
| 44466.677083333336 | 22.073 |
| 44466.6875 | 22.226 |
| 44466.697916666664 | 22.361 |
| 44466.708333333336 | 22.431 |
| 44466.71875 | 22.61 |
| 44466.729166666664 | 22.713 |
| 44466.739583333336 | 22.773 |
| 44466.75 | 22.827 |
| 44466.760416666664 | 22.877 |
| 44466.770833333336 | 22.868 |
| 44466.78125 | 23.102 |
| 44466.791666666664 | 23.27 |
| 44466.802083333336 | 23.478 |
| 44466.8125 | 23.906 |
| 44466.822916666664 | 24.145 |
| 44466.833333333336 | 24.075 |
| 44466.84375 | 24.176 |
| 44466.854166666664 | 23.891 |
| 44466.864583333336 | 23.996 |
| 44466.875 | 23.971 |
| 44466.885416666664 | 23.805 |
| 44466.895833333336 | 23.734 |
| 44466.90625 | 23.68 |
| 44466.916666666664 | 23.742 |
| 44466.927083333336 | 23.704 |
| 44466.9375 | 23.739 |
| 44466.947916666664 | 23.794 |
| 44466.958333333336 | 23.789 |
| 44466.96875 | 23.725 |
| 44466.979166666664 | 23.665 |
| 44466.989583333336 | 23.632 |
| 44467.0 | 23.594 |
| 44467.010416666664 | 23.583 |
| 44467.020833333336 | 23.581 |
| 44467.03125 | 23.555 |
| 44467.041666666664 | 23.562 |
| 44467.052083333336 | 23.518 |
| 44467.0625 | 23.536 |
| 44467.072916666664 | 23.511 |
| 44467.083333333336 | 23.492 |
| 44467.09375 | 23.426 |
| 44467.104166666664 | 23.315 |
| 44467.114583333336 | 23.234 |
| 44467.125 | 23.172 |
| 44467.135416666664 | 23.089 |
| 44467.145833333336 | 22.923 |
| 44467.15625 | 22.82 |
| 44467.166666666664 | 22.755 |
| 44467.177083333336 | 22.723 |
| 44467.1875 | 22.694 |
| 44467.197916666664 | 22.66 |
| 44467.208333333336 | 22.627 |
| 44467.21875 | 22.585 |
| 44467.229166666664 | 22.57 |
| 44467.239583333336 | 22.608 |
| 44467.25 | 22.584 |
| 44467.260416666664 | 22.439 |
| 44467.270833333336 | 22.443 |
| 44467.28125 | 22.242 |
| 44467.291666666664 | 22.18 |
| 44467.302083333336 | 22.197 |
| 44467.3125 | 22.133 |
| 44467.322916666664 | 22.128 |
| 44467.333333333336 | 22.092 |
| 44467.34375 | 22.112 |
| 44467.354166666664 | 21.956 |
| 44467.364583333336 | 21.976 |
| 44467.375 | 21.938 |
| 44467.385416666664 | 21.841 |
| 44467.395833333336 | 21.767 |
| 44467.40625 | 21.68 |
| 44467.416666666664 | 21.565 |
| 44467.427083333336 | 21.515 |
| 44467.4375 | 21.486 |
| 44467.447916666664 | 21.484 |
| 44467.458333333336 | 21.393 |
| 44467.46875 | 21.308 |
| 44467.479166666664 | 21.314 |
| 44467.489583333336 | 21.317 |
| 44467.5 | 21.308 |
| 44467.510416666664 | 21.33 |
| 44467.520833333336 | 21.434 |
| 44467.53125 | 21.547 |
| 44467.541666666664 | 21.532 |
| 44467.552083333336 | 21.595 |
| 44467.5625 | 21.646 |
| 44467.572916666664 | 21.694 |
| 44467.583333333336 | 21.743 |
| 44467.59375 | 21.813 |
| 44467.604166666664 | 21.846 |
| 44467.614583333336 | 21.892 |
| 44467.625 | 21.959 |
| 44467.635416666664 | 22.058 |
| 44467.645833333336 | 22.108 |
| 44467.65625 | 22.184 |
| 44467.666666666664 | 22.296 |
| 44467.677083333336 | 22.376 |
| 44467.6875 | 22.508 |
| 44467.697916666664 | 22.584 |
| 44467.708333333336 | 22.645 |
| 44467.71875 | 22.712 |
| 44467.729166666664 | 22.754 |
| 44467.739583333336 | 22.857 |
| 44467.75 | 22.974 |
| 44467.760416666664 | 23.16 |
| 44467.770833333336 | 23.25 |
| 44467.78125 | 23.216 |
| 44467.791666666664 | 23.277 |
| 44467.802083333336 | 23.288 |
| 44467.8125 | 23.577 |
| 44467.822916666664 | 23.54 |
| 44467.833333333336 | 24.224 |
| 44467.84375 | 24.537 |
| 44467.854166666664 | 24.87 |
| 44467.864583333336 | 24.982 |
| 44467.875 | 24.541 |
| 44467.885416666664 | 24.966 |
| 44467.895833333336 | 24.626 |
| 44467.90625 | 24.418 |
| 44467.916666666664 | 24.331 |
| 44467.927083333336 | 24.335 |
| 44467.9375 | 24.398 |
| 44467.947916666664 | 24.511 |
| 44467.958333333336 | 24.631 |
| 44467.96875 | 24.826 |
| 44467.979166666664 | 24.773 |
| 44467.989583333336 | 24.785 |
| 44468.0 | 24.792 |
| 44468.010416666664 | 24.805 |
| 44468.020833333336 | 24.806 |
| 44468.03125 | 24.82 |
| 44468.041666666664 | 24.819 |
| 44468.052083333336 | 24.776 |
| 44468.0625 | 24.721 |
| 44468.072916666664 | 24.599 |
| 44468.083333333336 | 24.591 |
| 44468.09375 | 24.591 |
| 44468.104166666664 | 24.55 |
| 44468.114583333336 | 24.478 |
| 44468.125 | 24.38 |
| 44468.135416666664 | 24.231 |
| 44468.145833333336 | 24.11 |
| 44468.15625 | 24.017 |
| 44468.166666666664 | 23.88 |
| 44468.177083333336 | 23.718 |
| 44468.1875 | 23.662 |
| 44468.197916666664 | 23.59 |
| 44468.208333333336 | 23.528 |
| 44468.21875 | 23.517 |
| 44468.229166666664 | 23.451 |
| 44468.239583333336 | 23.431 |
| 44468.25 | 23.395 |
| 44468.260416666664 | 23.381 |
| 44468.270833333336 | 23.356 |
| 44468.28125 | 23.497 |
| 44468.291666666664 | 23.403 |
| 44468.302083333336 | 23.296 |
| 44468.3125 | 23.331 |
| 44468.322916666664 | 23.282 |
| 44468.333333333336 | 23.17 |
| 44468.34375 | 23.093 |
| 44468.354166666664 | 23.043 |
| 44468.364583333336 | 22.901 |
| 44468.375 | 22.885 |
| 44468.385416666664 | 22.785 |
| 44468.395833333336 | 22.786 |
| 44468.40625 | 22.77 |
| 44468.416666666664 | 22.744 |
| 44468.427083333336 | 22.743 |
| 44468.4375 | 22.885 |
| 44468.447916666664 | 22.724 |
| 44468.458333333336 | 22.829 |
| 44468.46875 | 22.847 |
| 44468.479166666664 | 22.786 |
| 44468.489583333336 | 22.881 |
| 44468.5 | 22.818 |
| 44468.510416666664 | 22.864 |
| 44468.520833333336 | 22.836 |
| 44468.53125 | 22.827 |
| 44468.541666666664 | 22.851 |
| 44468.552083333336 | 22.879 |
| 44468.5625 | 22.83 |
| 44468.572916666664 | 22.843 |
| 44468.583333333336 | 22.887 |
| 44468.59375 | 22.93 |
| 44468.604166666664 | 22.924 |
| 44468.614583333336 | 22.917 |
| 44468.625 | 22.904 |
| 44468.635416666664 | 22.872 |
| 44468.645833333336 | 22.795 |
| 44468.65625 | 22.799 |
| 44468.666666666664 | 22.791 |
| 44468.677083333336 | 22.824 |
| 44468.6875 | 22.862 |
| 44468.697916666664 | 22.92 |
| 44468.708333333336 | 22.974 |
| 44468.71875 | 23.014 |
| 44468.729166666664 | 23.042 |
| 44468.739583333336 | 23.057 |
| 44468.75 | 23.063 |
| 44468.760416666664 | 23.071 |
| 44468.770833333336 | 23.09 |
| 44468.78125 | 23.108 |
| 44468.791666666664 | 23.129 |
| 44468.802083333336 | 23.156 |
| 44468.8125 | 23.173 |
| 44468.822916666664 | 23.221 |
| 44468.833333333336 | 23.315 |
| 44468.84375 | 23.307 |
| 44468.854166666664 | 23.333 |
| 44468.864583333336 | 23.403 |
| 44468.875 | 23.369 |
| 44468.885416666664 | 23.394 |
| 44468.895833333336 | 23.447 |
| 44468.90625 | 23.481 |
| 44468.916666666664 | 23.494 |
| 44468.927083333336 | 23.513 |
| 44468.9375 | 23.427 |
| 44468.947916666664 | 23.472 |
| 44468.958333333336 | 23.582 |
| 44468.96875 | 23.629 |
| 44468.979166666664 | 23.543 |
| 44468.989583333336 | 23.534 |
| 44469.0 | 23.434 |
| 44469.010416666664 | 23.379 |
| 44469.020833333336 | 23.198 |
| 44469.03125 | 23.196 |
| 44469.041666666664 | 23.102 |
| 44469.052083333336 | 23.115 |
| 44469.0625 | 23.033 |
| 44469.072916666664 | 22.942 |
| 44469.083333333336 | 22.958 |
| 44469.09375 | 22.941 |
| 44469.104166666664 | 22.897 |
| 44469.114583333336 | 22.92 |
| 44469.125 | 22.932 |
| 44469.135416666664 | 22.9 |
| 44469.145833333336 | 22.9 |
| 44469.15625 | 22.879 |
| 44469.166666666664 | 22.827 |
| 44469.177083333336 | 22.778 |
| 44469.1875 | 22.725 |
| 44469.197916666664 | 22.615 |
| 44469.208333333336 | 22.544 |
| 44469.21875 | 22.502 |
| 44469.229166666664 | 22.484 |
| 44469.239583333336 | 22.464 |
| 44469.25 | 22.434 |
| 44469.260416666664 | 22.408 |
| 44469.270833333336 | 22.382 |
| 44469.28125 | 22.365 |
| 44469.291666666664 | 22.332 |
| 44469.302083333336 | 22.302 |
| 44469.3125 | 22.267 |
| 44469.322916666664 | 22.225 |
| 44469.333333333336 | 22.204 |
| 44469.34375 | 22.16 |
| 44469.354166666664 | 22.065 |
| 44469.364583333336 | 22.052 |
| 44469.375 | 21.958 |
| 44469.385416666664 | 21.923 |
| 44469.395833333336 | 21.83 |
| 44469.40625 | 21.564 |
| 44469.416666666664 | 21.619 |
| 44469.427083333336 | 21.427 |
| 44469.4375 | 21.305 |
| 44469.447916666664 | 21.395 |
| 44469.458333333336 | 21.019 |
| 44469.46875 | 20.869 |
| 44469.479166666664 | 20.546 |
| 44469.489583333336 | 20.615 |
| 44469.5 | 20.482 |
| 44469.510416666664 | 20.641 |
| 44469.520833333336 | 20.353 |
| 44469.53125 | 20.43 |
| 44469.541666666664 | 20.308 |
| 44469.552083333336 | 20.29 |
| 44469.5625 | 20.226 |
| 44469.572916666664 | 20.249 |
| 44469.583333333336 | 20.29 |
| 44469.59375 | 20.306 |
| 44469.604166666664 | 20.471 |
| 44469.614583333336 | 20.491 |
| 44469.625 | 20.602 |
| 44469.635416666664 | 20.726 |
| 44469.645833333336 | 20.763 |
| 44469.65625 | 20.935 |
| 44469.666666666664 | 21.191 |
| 44469.677083333336 | 21.431 |
| 44469.6875 | 21.582 |
| 44469.697916666664 | 21.727 |
| 44469.708333333336 | 21.831 |
| 44469.71875 | 21.913 |
| 44469.729166666664 | 22.043 |
| 44469.739583333336 | 22.105 |
| 44469.75 | 22.288 |
| 44469.760416666664 | 22.311 |
| 44469.770833333336 | 22.387 |
| 44469.78125 | 22.434 |
| 44469.791666666664 | 22.494 |
| 44469.802083333336 | 22.55 |
| 44469.8125 | 22.62 |
| 44469.822916666664 | 22.718 |
| 44469.833333333336 | 22.732 |
| 44469.84375 | 22.743 |
| 44469.854166666664 | 22.77 |
| 44469.864583333336 | 22.792 |
| 44469.875 | 22.812 |
| 44469.885416666664 | 22.789 |
| 44469.895833333336 | 22.878 |
| 44469.90625 | 22.913 |
| 44469.916666666664 | 23.01 |
| 44469.927083333336 | 23.041 |
| 44469.9375 | 23.029 |
| 44469.947916666664 | 23.068 |
| 44469.958333333336 | 22.944 |
| 44469.96875 | 22.945 |
| 44469.979166666664 | 22.909 |
| 44469.989583333336 | 22.892 |
| 44470.0 | 22.826 |
| 44470.010416666664 | 22.744 |
| 44470.020833333336 | 22.632 |
| 44470.03125 | 22.561 |
| 44470.041666666664 | 22.419 |
| 44470.052083333336 | 22.265 |
| 44470.0625 | 22.167 |
| 44470.072916666664 | 22.074 |
| 44470.083333333336 | 22.017 |
| 44470.09375 | 21.932 |
| 44470.104166666664 | 21.886 |
| 44470.114583333336 | 21.829 |
| 44470.125 | 21.811 |
| 44470.135416666664 | 21.936 |
| 44470.145833333336 | 21.894 |
| 44470.15625 | 21.917 |